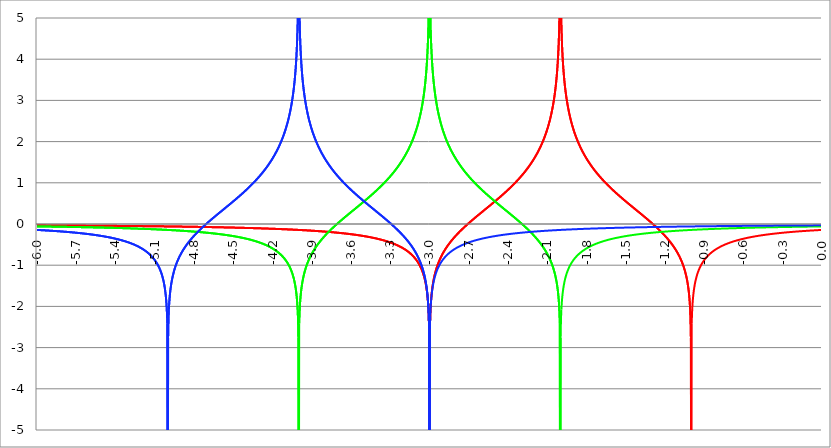
| Category | Series 1 | Series 0 | Series 2 |
|---|---|---|---|
| -6.0 | -0.032 | -0.059 | -0.144 |
| -5.997 | -0.032 | -0.059 | -0.144 |
| -5.994 | -0.032 | -0.059 | -0.145 |
| -5.991 | -0.032 | -0.059 | -0.145 |
| -5.988 | -0.032 | -0.059 | -0.146 |
| -5.984999999999999 | -0.033 | -0.06 | -0.146 |
| -5.982 | -0.033 | -0.06 | -0.147 |
| -5.979 | -0.033 | -0.06 | -0.147 |
| -5.976 | -0.033 | -0.06 | -0.148 |
| -5.972999999999999 | -0.033 | -0.06 | -0.148 |
| -5.969999999999999 | -0.033 | -0.06 | -0.149 |
| -5.966999999999999 | -0.033 | -0.06 | -0.15 |
| -5.963999999999999 | -0.033 | -0.06 | -0.15 |
| -5.960999999999998 | -0.033 | -0.061 | -0.151 |
| -5.957999999999998 | -0.033 | -0.061 | -0.151 |
| -5.954999999999998 | -0.033 | -0.061 | -0.152 |
| -5.951999999999998 | -0.033 | -0.061 | -0.152 |
| -5.948999999999998 | -0.033 | -0.061 | -0.153 |
| -5.945999999999998 | -0.033 | -0.061 | -0.153 |
| -5.942999999999998 | -0.033 | -0.061 | -0.154 |
| -5.939999999999997 | -0.033 | -0.061 | -0.154 |
| -5.936999999999997 | -0.033 | -0.062 | -0.155 |
| -5.933999999999997 | -0.033 | -0.062 | -0.156 |
| -5.930999999999997 | -0.033 | -0.062 | -0.156 |
| -5.927999999999997 | -0.034 | -0.062 | -0.157 |
| -5.924999999999997 | -0.034 | -0.062 | -0.157 |
| -5.921999999999997 | -0.034 | -0.062 | -0.158 |
| -5.918999999999997 | -0.034 | -0.062 | -0.158 |
| -5.915999999999997 | -0.034 | -0.063 | -0.159 |
| -5.912999999999997 | -0.034 | -0.063 | -0.16 |
| -5.909999999999996 | -0.034 | -0.063 | -0.16 |
| -5.906999999999996 | -0.034 | -0.063 | -0.161 |
| -5.903999999999996 | -0.034 | -0.063 | -0.161 |
| -5.900999999999996 | -0.034 | -0.063 | -0.162 |
| -5.897999999999996 | -0.034 | -0.063 | -0.163 |
| -5.894999999999996 | -0.034 | -0.064 | -0.163 |
| -5.891999999999996 | -0.034 | -0.064 | -0.164 |
| -5.888999999999996 | -0.034 | -0.064 | -0.164 |
| -5.885999999999996 | -0.034 | -0.064 | -0.165 |
| -5.882999999999996 | -0.034 | -0.064 | -0.166 |
| -5.879999999999995 | -0.034 | -0.064 | -0.166 |
| -5.876999999999995 | -0.034 | -0.064 | -0.167 |
| -5.873999999999995 | -0.034 | -0.065 | -0.168 |
| -5.870999999999995 | -0.035 | -0.065 | -0.168 |
| -5.867999999999995 | -0.035 | -0.065 | -0.169 |
| -5.864999999999995 | -0.035 | -0.065 | -0.169 |
| -5.861999999999995 | -0.035 | -0.065 | -0.17 |
| -5.858999999999995 | -0.035 | -0.065 | -0.171 |
| -5.855999999999994 | -0.035 | -0.065 | -0.171 |
| -5.852999999999994 | -0.035 | -0.066 | -0.172 |
| -5.849999999999994 | -0.035 | -0.066 | -0.173 |
| -5.846999999999994 | -0.035 | -0.066 | -0.173 |
| -5.843999999999994 | -0.035 | -0.066 | -0.174 |
| -5.840999999999994 | -0.035 | -0.066 | -0.175 |
| -5.837999999999994 | -0.035 | -0.066 | -0.175 |
| -5.834999999999994 | -0.035 | -0.066 | -0.176 |
| -5.831999999999994 | -0.035 | -0.067 | -0.177 |
| -5.828999999999993 | -0.035 | -0.067 | -0.178 |
| -5.825999999999993 | -0.035 | -0.067 | -0.178 |
| -5.822999999999993 | -0.035 | -0.067 | -0.179 |
| -5.819999999999993 | -0.035 | -0.067 | -0.18 |
| -5.816999999999993 | -0.036 | -0.067 | -0.18 |
| -5.813999999999993 | -0.036 | -0.068 | -0.181 |
| -5.810999999999993 | -0.036 | -0.068 | -0.182 |
| -5.807999999999993 | -0.036 | -0.068 | -0.183 |
| -5.804999999999993 | -0.036 | -0.068 | -0.183 |
| -5.801999999999992 | -0.036 | -0.068 | -0.184 |
| -5.798999999999992 | -0.036 | -0.068 | -0.185 |
| -5.795999999999992 | -0.036 | -0.068 | -0.186 |
| -5.792999999999992 | -0.036 | -0.069 | -0.186 |
| -5.789999999999992 | -0.036 | -0.069 | -0.187 |
| -5.786999999999992 | -0.036 | -0.069 | -0.188 |
| -5.783999999999992 | -0.036 | -0.069 | -0.189 |
| -5.780999999999992 | -0.036 | -0.069 | -0.189 |
| -5.777999999999992 | -0.036 | -0.069 | -0.19 |
| -5.774999999999991 | -0.036 | -0.07 | -0.191 |
| -5.771999999999991 | -0.036 | -0.07 | -0.192 |
| -5.768999999999991 | -0.036 | -0.07 | -0.193 |
| -5.765999999999991 | -0.037 | -0.07 | -0.193 |
| -5.762999999999991 | -0.037 | -0.07 | -0.194 |
| -5.759999999999991 | -0.037 | -0.07 | -0.195 |
| -5.756999999999991 | -0.037 | -0.071 | -0.196 |
| -5.753999999999991 | -0.037 | -0.071 | -0.197 |
| -5.75099999999999 | -0.037 | -0.071 | -0.197 |
| -5.74799999999999 | -0.037 | -0.071 | -0.198 |
| -5.74499999999999 | -0.037 | -0.071 | -0.199 |
| -5.74199999999999 | -0.037 | -0.071 | -0.2 |
| -5.73899999999999 | -0.037 | -0.072 | -0.201 |
| -5.73599999999999 | -0.037 | -0.072 | -0.202 |
| -5.73299999999999 | -0.037 | -0.072 | -0.202 |
| -5.72999999999999 | -0.037 | -0.072 | -0.203 |
| -5.72699999999999 | -0.037 | -0.072 | -0.204 |
| -5.723999999999989 | -0.037 | -0.072 | -0.205 |
| -5.720999999999989 | -0.037 | -0.073 | -0.206 |
| -5.717999999999989 | -0.038 | -0.073 | -0.207 |
| -5.714999999999989 | -0.038 | -0.073 | -0.208 |
| -5.71199999999999 | -0.038 | -0.073 | -0.209 |
| -5.708999999999989 | -0.038 | -0.073 | -0.21 |
| -5.705999999999989 | -0.038 | -0.073 | -0.21 |
| -5.702999999999989 | -0.038 | -0.074 | -0.211 |
| -5.699999999999989 | -0.038 | -0.074 | -0.212 |
| -5.696999999999988 | -0.038 | -0.074 | -0.213 |
| -5.693999999999988 | -0.038 | -0.074 | -0.214 |
| -5.690999999999988 | -0.038 | -0.074 | -0.215 |
| -5.687999999999988 | -0.038 | -0.074 | -0.216 |
| -5.684999999999988 | -0.038 | -0.075 | -0.217 |
| -5.681999999999988 | -0.038 | -0.075 | -0.218 |
| -5.678999999999988 | -0.038 | -0.075 | -0.219 |
| -5.675999999999988 | -0.038 | -0.075 | -0.22 |
| -5.672999999999988 | -0.039 | -0.075 | -0.221 |
| -5.669999999999987 | -0.039 | -0.076 | -0.222 |
| -5.666999999999987 | -0.039 | -0.076 | -0.223 |
| -5.663999999999987 | -0.039 | -0.076 | -0.224 |
| -5.660999999999987 | -0.039 | -0.076 | -0.225 |
| -5.657999999999987 | -0.039 | -0.076 | -0.226 |
| -5.654999999999987 | -0.039 | -0.076 | -0.227 |
| -5.651999999999987 | -0.039 | -0.077 | -0.228 |
| -5.648999999999987 | -0.039 | -0.077 | -0.229 |
| -5.645999999999986 | -0.039 | -0.077 | -0.23 |
| -5.642999999999986 | -0.039 | -0.077 | -0.231 |
| -5.639999999999986 | -0.039 | -0.077 | -0.232 |
| -5.636999999999986 | -0.039 | -0.078 | -0.234 |
| -5.633999999999986 | -0.039 | -0.078 | -0.235 |
| -5.630999999999986 | -0.039 | -0.078 | -0.236 |
| -5.627999999999986 | -0.04 | -0.078 | -0.237 |
| -5.624999999999986 | -0.04 | -0.078 | -0.238 |
| -5.621999999999986 | -0.04 | -0.079 | -0.239 |
| -5.618999999999985 | -0.04 | -0.079 | -0.24 |
| -5.615999999999985 | -0.04 | -0.079 | -0.241 |
| -5.612999999999985 | -0.04 | -0.079 | -0.243 |
| -5.609999999999985 | -0.04 | -0.079 | -0.244 |
| -5.606999999999985 | -0.04 | -0.08 | -0.245 |
| -5.603999999999985 | -0.04 | -0.08 | -0.246 |
| -5.600999999999985 | -0.04 | -0.08 | -0.247 |
| -5.597999999999985 | -0.04 | -0.08 | -0.248 |
| -5.594999999999985 | -0.04 | -0.08 | -0.25 |
| -5.591999999999984 | -0.04 | -0.081 | -0.251 |
| -5.588999999999984 | -0.04 | -0.081 | -0.252 |
| -5.585999999999984 | -0.04 | -0.081 | -0.253 |
| -5.582999999999984 | -0.041 | -0.081 | -0.255 |
| -5.579999999999984 | -0.041 | -0.081 | -0.256 |
| -5.576999999999984 | -0.041 | -0.082 | -0.257 |
| -5.573999999999984 | -0.041 | -0.082 | -0.258 |
| -5.570999999999984 | -0.041 | -0.082 | -0.26 |
| -5.567999999999984 | -0.041 | -0.082 | -0.261 |
| -5.564999999999984 | -0.041 | -0.082 | -0.262 |
| -5.561999999999983 | -0.041 | -0.083 | -0.264 |
| -5.558999999999983 | -0.041 | -0.083 | -0.265 |
| -5.555999999999983 | -0.041 | -0.083 | -0.266 |
| -5.552999999999983 | -0.041 | -0.083 | -0.268 |
| -5.549999999999983 | -0.041 | -0.083 | -0.269 |
| -5.546999999999983 | -0.041 | -0.084 | -0.271 |
| -5.543999999999983 | -0.041 | -0.084 | -0.272 |
| -5.540999999999983 | -0.042 | -0.084 | -0.273 |
| -5.537999999999982 | -0.042 | -0.084 | -0.275 |
| -5.534999999999982 | -0.042 | -0.085 | -0.276 |
| -5.531999999999982 | -0.042 | -0.085 | -0.278 |
| -5.528999999999982 | -0.042 | -0.085 | -0.279 |
| -5.525999999999982 | -0.042 | -0.085 | -0.281 |
| -5.522999999999982 | -0.042 | -0.085 | -0.282 |
| -5.519999999999982 | -0.042 | -0.086 | -0.284 |
| -5.516999999999982 | -0.042 | -0.086 | -0.285 |
| -5.513999999999982 | -0.042 | -0.086 | -0.287 |
| -5.510999999999981 | -0.042 | -0.086 | -0.288 |
| -5.507999999999981 | -0.042 | -0.087 | -0.29 |
| -5.504999999999981 | -0.042 | -0.087 | -0.291 |
| -5.501999999999981 | -0.043 | -0.087 | -0.293 |
| -5.498999999999981 | -0.043 | -0.087 | -0.294 |
| -5.495999999999981 | -0.043 | -0.087 | -0.296 |
| -5.492999999999981 | -0.043 | -0.088 | -0.298 |
| -5.48999999999998 | -0.043 | -0.088 | -0.299 |
| -5.48699999999998 | -0.043 | -0.088 | -0.301 |
| -5.48399999999998 | -0.043 | -0.088 | -0.303 |
| -5.48099999999998 | -0.043 | -0.089 | -0.304 |
| -5.47799999999998 | -0.043 | -0.089 | -0.306 |
| -5.47499999999998 | -0.043 | -0.089 | -0.308 |
| -5.47199999999998 | -0.043 | -0.089 | -0.309 |
| -5.46899999999998 | -0.043 | -0.09 | -0.311 |
| -5.46599999999998 | -0.043 | -0.09 | -0.313 |
| -5.46299999999998 | -0.044 | -0.09 | -0.315 |
| -5.45999999999998 | -0.044 | -0.09 | -0.317 |
| -5.45699999999998 | -0.044 | -0.091 | -0.318 |
| -5.45399999999998 | -0.044 | -0.091 | -0.32 |
| -5.45099999999998 | -0.044 | -0.091 | -0.322 |
| -5.44799999999998 | -0.044 | -0.091 | -0.324 |
| -5.444999999999979 | -0.044 | -0.092 | -0.326 |
| -5.441999999999978 | -0.044 | -0.092 | -0.328 |
| -5.438999999999978 | -0.044 | -0.092 | -0.33 |
| -5.435999999999978 | -0.044 | -0.092 | -0.332 |
| -5.432999999999978 | -0.044 | -0.093 | -0.334 |
| -5.429999999999978 | -0.044 | -0.093 | -0.336 |
| -5.426999999999978 | -0.044 | -0.093 | -0.338 |
| -5.423999999999978 | -0.045 | -0.093 | -0.34 |
| -5.420999999999978 | -0.045 | -0.094 | -0.342 |
| -5.417999999999978 | -0.045 | -0.094 | -0.344 |
| -5.414999999999978 | -0.045 | -0.094 | -0.346 |
| -5.411999999999977 | -0.045 | -0.094 | -0.348 |
| -5.408999999999977 | -0.045 | -0.095 | -0.35 |
| -5.405999999999977 | -0.045 | -0.095 | -0.352 |
| -5.402999999999977 | -0.045 | -0.095 | -0.355 |
| -5.399999999999977 | -0.045 | -0.095 | -0.357 |
| -5.396999999999977 | -0.045 | -0.096 | -0.359 |
| -5.393999999999977 | -0.045 | -0.096 | -0.361 |
| -5.390999999999977 | -0.045 | -0.096 | -0.364 |
| -5.387999999999977 | -0.046 | -0.096 | -0.366 |
| -5.384999999999977 | -0.046 | -0.097 | -0.368 |
| -5.381999999999976 | -0.046 | -0.097 | -0.371 |
| -5.378999999999976 | -0.046 | -0.097 | -0.373 |
| -5.375999999999976 | -0.046 | -0.097 | -0.376 |
| -5.372999999999976 | -0.046 | -0.098 | -0.378 |
| -5.369999999999976 | -0.046 | -0.098 | -0.38 |
| -5.366999999999976 | -0.046 | -0.098 | -0.383 |
| -5.363999999999976 | -0.046 | -0.099 | -0.386 |
| -5.360999999999976 | -0.046 | -0.099 | -0.388 |
| -5.357999999999976 | -0.046 | -0.099 | -0.391 |
| -5.354999999999976 | -0.047 | -0.099 | -0.393 |
| -5.351999999999975 | -0.047 | -0.1 | -0.396 |
| -5.348999999999975 | -0.047 | -0.1 | -0.399 |
| -5.345999999999975 | -0.047 | -0.1 | -0.401 |
| -5.342999999999975 | -0.047 | -0.101 | -0.404 |
| -5.339999999999974 | -0.047 | -0.101 | -0.407 |
| -5.336999999999974 | -0.047 | -0.101 | -0.41 |
| -5.333999999999974 | -0.047 | -0.101 | -0.413 |
| -5.330999999999974 | -0.047 | -0.102 | -0.416 |
| -5.327999999999974 | -0.047 | -0.102 | -0.419 |
| -5.324999999999974 | -0.047 | -0.102 | -0.422 |
| -5.321999999999974 | -0.047 | -0.103 | -0.425 |
| -5.318999999999974 | -0.048 | -0.103 | -0.428 |
| -5.315999999999974 | -0.048 | -0.103 | -0.431 |
| -5.312999999999974 | -0.048 | -0.103 | -0.434 |
| -5.309999999999974 | -0.048 | -0.104 | -0.437 |
| -5.306999999999974 | -0.048 | -0.104 | -0.44 |
| -5.303999999999974 | -0.048 | -0.104 | -0.443 |
| -5.300999999999973 | -0.048 | -0.105 | -0.447 |
| -5.297999999999973 | -0.048 | -0.105 | -0.45 |
| -5.294999999999973 | -0.048 | -0.105 | -0.454 |
| -5.291999999999973 | -0.048 | -0.106 | -0.457 |
| -5.288999999999973 | -0.048 | -0.106 | -0.46 |
| -5.285999999999973 | -0.049 | -0.106 | -0.464 |
| -5.282999999999973 | -0.049 | -0.107 | -0.468 |
| -5.279999999999972 | -0.049 | -0.107 | -0.471 |
| -5.276999999999972 | -0.049 | -0.107 | -0.475 |
| -5.273999999999972 | -0.049 | -0.107 | -0.479 |
| -5.270999999999972 | -0.049 | -0.108 | -0.483 |
| -5.267999999999972 | -0.049 | -0.108 | -0.486 |
| -5.264999999999972 | -0.049 | -0.108 | -0.49 |
| -5.261999999999972 | -0.049 | -0.109 | -0.494 |
| -5.258999999999972 | -0.049 | -0.109 | -0.498 |
| -5.255999999999972 | -0.05 | -0.109 | -0.502 |
| -5.252999999999972 | -0.05 | -0.11 | -0.507 |
| -5.249999999999971 | -0.05 | -0.11 | -0.511 |
| -5.246999999999971 | -0.05 | -0.11 | -0.515 |
| -5.243999999999971 | -0.05 | -0.111 | -0.519 |
| -5.240999999999971 | -0.05 | -0.111 | -0.524 |
| -5.237999999999971 | -0.05 | -0.111 | -0.528 |
| -5.234999999999971 | -0.05 | -0.112 | -0.533 |
| -5.23199999999997 | -0.05 | -0.112 | -0.538 |
| -5.228999999999971 | -0.05 | -0.112 | -0.542 |
| -5.225999999999971 | -0.051 | -0.113 | -0.547 |
| -5.222999999999971 | -0.051 | -0.113 | -0.552 |
| -5.21999999999997 | -0.051 | -0.113 | -0.557 |
| -5.21699999999997 | -0.051 | -0.114 | -0.562 |
| -5.21399999999997 | -0.051 | -0.114 | -0.567 |
| -5.21099999999997 | -0.051 | -0.114 | -0.573 |
| -5.20799999999997 | -0.051 | -0.115 | -0.578 |
| -5.20499999999997 | -0.051 | -0.115 | -0.583 |
| -5.20199999999997 | -0.051 | -0.115 | -0.589 |
| -5.19899999999997 | -0.051 | -0.116 | -0.595 |
| -5.19599999999997 | -0.052 | -0.116 | -0.6 |
| -5.192999999999969 | -0.052 | -0.117 | -0.606 |
| -5.18999999999997 | -0.052 | -0.117 | -0.612 |
| -5.18699999999997 | -0.052 | -0.117 | -0.618 |
| -5.18399999999997 | -0.052 | -0.118 | -0.625 |
| -5.180999999999969 | -0.052 | -0.118 | -0.631 |
| -5.177999999999969 | -0.052 | -0.118 | -0.638 |
| -5.174999999999969 | -0.052 | -0.119 | -0.644 |
| -5.171999999999968 | -0.052 | -0.119 | -0.651 |
| -5.168999999999968 | -0.052 | -0.119 | -0.658 |
| -5.165999999999968 | -0.053 | -0.12 | -0.665 |
| -5.162999999999968 | -0.053 | -0.12 | -0.672 |
| -5.159999999999968 | -0.053 | -0.121 | -0.68 |
| -5.156999999999968 | -0.053 | -0.121 | -0.687 |
| -5.153999999999968 | -0.053 | -0.121 | -0.695 |
| -5.150999999999968 | -0.053 | -0.122 | -0.703 |
| -5.147999999999968 | -0.053 | -0.122 | -0.711 |
| -5.144999999999968 | -0.053 | -0.123 | -0.719 |
| -5.141999999999967 | -0.053 | -0.123 | -0.728 |
| -5.138999999999967 | -0.054 | -0.123 | -0.737 |
| -5.135999999999967 | -0.054 | -0.124 | -0.746 |
| -5.132999999999967 | -0.054 | -0.124 | -0.755 |
| -5.129999999999967 | -0.054 | -0.124 | -0.764 |
| -5.126999999999967 | -0.054 | -0.125 | -0.774 |
| -5.123999999999967 | -0.054 | -0.125 | -0.784 |
| -5.120999999999967 | -0.054 | -0.126 | -0.794 |
| -5.117999999999967 | -0.054 | -0.126 | -0.805 |
| -5.114999999999966 | -0.054 | -0.127 | -0.816 |
| -5.111999999999966 | -0.054 | -0.127 | -0.827 |
| -5.108999999999966 | -0.055 | -0.127 | -0.839 |
| -5.105999999999966 | -0.055 | -0.128 | -0.851 |
| -5.102999999999966 | -0.055 | -0.128 | -0.863 |
| -5.099999999999965 | -0.055 | -0.129 | -0.876 |
| -5.096999999999965 | -0.055 | -0.129 | -0.889 |
| -5.093999999999965 | -0.055 | -0.129 | -0.903 |
| -5.090999999999965 | -0.055 | -0.13 | -0.917 |
| -5.087999999999965 | -0.055 | -0.13 | -0.931 |
| -5.084999999999965 | -0.056 | -0.131 | -0.947 |
| -5.081999999999965 | -0.056 | -0.131 | -0.963 |
| -5.078999999999965 | -0.056 | -0.132 | -0.979 |
| -5.075999999999964 | -0.056 | -0.132 | -0.997 |
| -5.072999999999964 | -0.056 | -0.132 | -1.015 |
| -5.069999999999964 | -0.056 | -0.133 | -1.034 |
| -5.066999999999964 | -0.056 | -0.133 | -1.053 |
| -5.063999999999964 | -0.056 | -0.134 | -1.074 |
| -5.060999999999964 | -0.056 | -0.134 | -1.096 |
| -5.057999999999964 | -0.057 | -0.135 | -1.119 |
| -5.054999999999964 | -0.057 | -0.135 | -1.144 |
| -5.051999999999964 | -0.057 | -0.136 | -1.17 |
| -5.048999999999964 | -0.057 | -0.136 | -1.197 |
| -5.045999999999964 | -0.057 | -0.136 | -1.227 |
| -5.042999999999964 | -0.057 | -0.137 | -1.258 |
| -5.039999999999963 | -0.057 | -0.137 | -1.292 |
| -5.036999999999963 | -0.057 | -0.138 | -1.329 |
| -5.033999999999963 | -0.058 | -0.138 | -1.369 |
| -5.030999999999963 | -0.058 | -0.139 | -1.413 |
| -5.027999999999963 | -0.058 | -0.139 | -1.462 |
| -5.024999999999963 | -0.058 | -0.14 | -1.516 |
| -5.021999999999963 | -0.058 | -0.14 | -1.578 |
| -5.018999999999963 | -0.058 | -0.141 | -1.649 |
| -5.015999999999963 | -0.058 | -0.141 | -1.733 |
| -5.012999999999963 | -0.058 | -0.142 | -1.835 |
| -5.009999999999962 | -0.058 | -0.142 | -1.963 |
| -5.006999999999962 | -0.059 | -0.143 | -2.14 |
| -5.003999999999962 | -0.059 | -0.143 | -2.417 |
| -5.000999999999962 | -0.059 | -0.144 | -10 |
| -4.997999999999962 | -0.059 | -0.144 | -2.759 |
| -4.994999999999962 | -0.059 | -0.145 | -2.299 |
| -4.991999999999961 | -0.059 | -0.145 | -2.062 |
| -4.988999999999961 | -0.059 | -0.146 | -1.9 |
| -4.985999999999961 | -0.059 | -0.146 | -1.777 |
| -4.982999999999961 | -0.06 | -0.147 | -1.678 |
| -4.97999999999996 | -0.06 | -0.147 | -1.594 |
| -4.97699999999996 | -0.06 | -0.148 | -1.522 |
| -4.97399999999996 | -0.06 | -0.148 | -1.458 |
| -4.97099999999996 | -0.06 | -0.149 | -1.402 |
| -4.967999999999961 | -0.06 | -0.149 | -1.35 |
| -4.964999999999961 | -0.06 | -0.15 | -1.303 |
| -4.96199999999996 | -0.061 | -0.15 | -1.259 |
| -4.95899999999996 | -0.061 | -0.151 | -1.219 |
| -4.95599999999996 | -0.061 | -0.151 | -1.181 |
| -4.95299999999996 | -0.061 | -0.152 | -1.146 |
| -4.94999999999996 | -0.061 | -0.153 | -1.113 |
| -4.94699999999996 | -0.061 | -0.153 | -1.081 |
| -4.94399999999996 | -0.061 | -0.154 | -1.051 |
| -4.94099999999996 | -0.061 | -0.154 | -1.023 |
| -4.93799999999996 | -0.062 | -0.155 | -0.995 |
| -4.93499999999996 | -0.062 | -0.155 | -0.969 |
| -4.93199999999996 | -0.062 | -0.156 | -0.944 |
| -4.928999999999959 | -0.062 | -0.156 | -0.92 |
| -4.925999999999959 | -0.062 | -0.157 | -0.897 |
| -4.922999999999959 | -0.062 | -0.158 | -0.875 |
| -4.91999999999996 | -0.062 | -0.158 | -0.853 |
| -4.916999999999959 | -0.063 | -0.159 | -0.832 |
| -4.913999999999959 | -0.063 | -0.159 | -0.812 |
| -4.910999999999959 | -0.063 | -0.16 | -0.793 |
| -4.907999999999959 | -0.063 | -0.161 | -0.773 |
| -4.904999999999958 | -0.063 | -0.161 | -0.755 |
| -4.901999999999958 | -0.063 | -0.162 | -0.737 |
| -4.898999999999958 | -0.063 | -0.162 | -0.719 |
| -4.895999999999958 | -0.063 | -0.163 | -0.702 |
| -4.892999999999958 | -0.064 | -0.164 | -0.685 |
| -4.889999999999958 | -0.064 | -0.164 | -0.669 |
| -4.886999999999958 | -0.064 | -0.165 | -0.653 |
| -4.883999999999958 | -0.064 | -0.165 | -0.637 |
| -4.880999999999958 | -0.064 | -0.166 | -0.622 |
| -4.877999999999957 | -0.064 | -0.167 | -0.607 |
| -4.874999999999957 | -0.064 | -0.167 | -0.592 |
| -4.871999999999957 | -0.065 | -0.168 | -0.577 |
| -4.868999999999957 | -0.065 | -0.169 | -0.563 |
| -4.865999999999957 | -0.065 | -0.169 | -0.549 |
| -4.862999999999957 | -0.065 | -0.17 | -0.535 |
| -4.859999999999957 | -0.065 | -0.171 | -0.522 |
| -4.856999999999957 | -0.065 | -0.171 | -0.509 |
| -4.853999999999957 | -0.065 | -0.172 | -0.496 |
| -4.850999999999956 | -0.066 | -0.173 | -0.483 |
| -4.847999999999956 | -0.066 | -0.173 | -0.47 |
| -4.844999999999956 | -0.066 | -0.174 | -0.458 |
| -4.841999999999956 | -0.066 | -0.175 | -0.445 |
| -4.838999999999956 | -0.066 | -0.175 | -0.433 |
| -4.835999999999956 | -0.066 | -0.176 | -0.421 |
| -4.832999999999956 | -0.067 | -0.177 | -0.409 |
| -4.829999999999956 | -0.067 | -0.177 | -0.397 |
| -4.826999999999955 | -0.067 | -0.178 | -0.386 |
| -4.823999999999955 | -0.067 | -0.179 | -0.375 |
| -4.820999999999955 | -0.067 | -0.179 | -0.363 |
| -4.817999999999955 | -0.067 | -0.18 | -0.352 |
| -4.814999999999955 | -0.067 | -0.181 | -0.341 |
| -4.811999999999955 | -0.068 | -0.182 | -0.33 |
| -4.808999999999955 | -0.068 | -0.182 | -0.319 |
| -4.805999999999955 | -0.068 | -0.183 | -0.309 |
| -4.802999999999955 | -0.068 | -0.184 | -0.298 |
| -4.799999999999954 | -0.068 | -0.185 | -0.288 |
| -4.796999999999954 | -0.068 | -0.185 | -0.277 |
| -4.793999999999954 | -0.069 | -0.186 | -0.267 |
| -4.790999999999954 | -0.069 | -0.187 | -0.257 |
| -4.787999999999954 | -0.069 | -0.188 | -0.247 |
| -4.784999999999954 | -0.069 | -0.188 | -0.237 |
| -4.781999999999954 | -0.069 | -0.189 | -0.227 |
| -4.778999999999954 | -0.069 | -0.19 | -0.217 |
| -4.775999999999954 | -0.069 | -0.191 | -0.207 |
| -4.772999999999953 | -0.07 | -0.191 | -0.198 |
| -4.769999999999953 | -0.07 | -0.192 | -0.188 |
| -4.766999999999953 | -0.07 | -0.193 | -0.178 |
| -4.763999999999953 | -0.07 | -0.194 | -0.169 |
| -4.760999999999953 | -0.07 | -0.195 | -0.16 |
| -4.757999999999953 | -0.07 | -0.195 | -0.15 |
| -4.754999999999953 | -0.071 | -0.196 | -0.141 |
| -4.751999999999953 | -0.071 | -0.197 | -0.132 |
| -4.748999999999953 | -0.071 | -0.198 | -0.123 |
| -4.745999999999952 | -0.071 | -0.199 | -0.114 |
| -4.742999999999952 | -0.071 | -0.2 | -0.104 |
| -4.739999999999952 | -0.071 | -0.2 | -0.095 |
| -4.736999999999952 | -0.072 | -0.201 | -0.087 |
| -4.733999999999952 | -0.072 | -0.202 | -0.078 |
| -4.730999999999952 | -0.072 | -0.203 | -0.069 |
| -4.727999999999952 | -0.072 | -0.204 | -0.06 |
| -4.724999999999952 | -0.072 | -0.205 | -0.051 |
| -4.721999999999951 | -0.072 | -0.206 | -0.043 |
| -4.718999999999951 | -0.073 | -0.207 | -0.034 |
| -4.715999999999951 | -0.073 | -0.207 | -0.025 |
| -4.712999999999951 | -0.073 | -0.208 | -0.017 |
| -4.709999999999951 | -0.073 | -0.209 | -0.008 |
| -4.706999999999951 | -0.073 | -0.21 | 0 |
| -4.703999999999951 | -0.074 | -0.211 | 0.009 |
| -4.700999999999951 | -0.074 | -0.212 | 0.017 |
| -4.697999999999951 | -0.074 | -0.213 | 0.026 |
| -4.69499999999995 | -0.074 | -0.214 | 0.034 |
| -4.69199999999995 | -0.074 | -0.215 | 0.042 |
| -4.68899999999995 | -0.074 | -0.216 | 0.051 |
| -4.68599999999995 | -0.075 | -0.217 | 0.059 |
| -4.68299999999995 | -0.075 | -0.218 | 0.067 |
| -4.67999999999995 | -0.075 | -0.219 | 0.075 |
| -4.67699999999995 | -0.075 | -0.22 | 0.084 |
| -4.67399999999995 | -0.075 | -0.221 | 0.092 |
| -4.67099999999995 | -0.076 | -0.222 | 0.1 |
| -4.667999999999949 | -0.076 | -0.223 | 0.108 |
| -4.664999999999949 | -0.076 | -0.224 | 0.116 |
| -4.661999999999949 | -0.076 | -0.225 | 0.124 |
| -4.658999999999949 | -0.076 | -0.226 | 0.132 |
| -4.655999999999949 | -0.076 | -0.227 | 0.14 |
| -4.652999999999949 | -0.077 | -0.228 | 0.148 |
| -4.649999999999949 | -0.077 | -0.229 | 0.156 |
| -4.646999999999949 | -0.077 | -0.23 | 0.164 |
| -4.643999999999949 | -0.077 | -0.231 | 0.172 |
| -4.640999999999948 | -0.077 | -0.232 | 0.18 |
| -4.637999999999948 | -0.078 | -0.233 | 0.188 |
| -4.634999999999948 | -0.078 | -0.234 | 0.196 |
| -4.631999999999948 | -0.078 | -0.235 | 0.204 |
| -4.628999999999948 | -0.078 | -0.236 | 0.212 |
| -4.625999999999948 | -0.078 | -0.238 | 0.22 |
| -4.622999999999948 | -0.079 | -0.239 | 0.228 |
| -4.619999999999948 | -0.079 | -0.24 | 0.235 |
| -4.616999999999947 | -0.079 | -0.241 | 0.243 |
| -4.613999999999947 | -0.079 | -0.242 | 0.251 |
| -4.610999999999947 | -0.079 | -0.243 | 0.259 |
| -4.607999999999947 | -0.08 | -0.244 | 0.267 |
| -4.604999999999947 | -0.08 | -0.246 | 0.275 |
| -4.601999999999947 | -0.08 | -0.247 | 0.282 |
| -4.598999999999947 | -0.08 | -0.248 | 0.29 |
| -4.595999999999947 | -0.08 | -0.249 | 0.298 |
| -4.592999999999947 | -0.081 | -0.25 | 0.306 |
| -4.589999999999946 | -0.081 | -0.252 | 0.314 |
| -4.586999999999946 | -0.081 | -0.253 | 0.321 |
| -4.583999999999946 | -0.081 | -0.254 | 0.329 |
| -4.580999999999946 | -0.081 | -0.255 | 0.337 |
| -4.577999999999946 | -0.082 | -0.257 | 0.345 |
| -4.574999999999946 | -0.082 | -0.258 | 0.353 |
| -4.571999999999945 | -0.082 | -0.259 | 0.36 |
| -4.568999999999946 | -0.082 | -0.261 | 0.368 |
| -4.565999999999946 | -0.082 | -0.262 | 0.376 |
| -4.562999999999946 | -0.083 | -0.263 | 0.384 |
| -4.559999999999945 | -0.083 | -0.265 | 0.392 |
| -4.556999999999945 | -0.083 | -0.266 | 0.399 |
| -4.553999999999945 | -0.083 | -0.267 | 0.407 |
| -4.550999999999945 | -0.083 | -0.269 | 0.415 |
| -4.547999999999945 | -0.084 | -0.27 | 0.423 |
| -4.544999999999945 | -0.084 | -0.271 | 0.431 |
| -4.541999999999944 | -0.084 | -0.273 | 0.439 |
| -4.538999999999944 | -0.084 | -0.274 | 0.446 |
| -4.535999999999944 | -0.084 | -0.276 | 0.454 |
| -4.532999999999944 | -0.085 | -0.277 | 0.462 |
| -4.529999999999944 | -0.085 | -0.279 | 0.47 |
| -4.526999999999944 | -0.085 | -0.28 | 0.478 |
| -4.523999999999944 | -0.085 | -0.282 | 0.486 |
| -4.520999999999944 | -0.086 | -0.283 | 0.494 |
| -4.517999999999944 | -0.086 | -0.285 | 0.502 |
| -4.514999999999944 | -0.086 | -0.286 | 0.509 |
| -4.511999999999944 | -0.086 | -0.288 | 0.517 |
| -4.508999999999943 | -0.086 | -0.289 | 0.525 |
| -4.505999999999943 | -0.087 | -0.291 | 0.533 |
| -4.502999999999943 | -0.087 | -0.292 | 0.541 |
| -4.499999999999943 | -0.087 | -0.294 | 0.549 |
| -4.496999999999943 | -0.087 | -0.296 | 0.557 |
| -4.493999999999943 | -0.088 | -0.297 | 0.565 |
| -4.490999999999943 | -0.088 | -0.299 | 0.573 |
| -4.487999999999943 | -0.088 | -0.3 | 0.581 |
| -4.484999999999943 | -0.088 | -0.302 | 0.59 |
| -4.481999999999942 | -0.089 | -0.304 | 0.598 |
| -4.478999999999942 | -0.089 | -0.305 | 0.606 |
| -4.475999999999942 | -0.089 | -0.307 | 0.614 |
| -4.472999999999942 | -0.089 | -0.309 | 0.622 |
| -4.469999999999942 | -0.09 | -0.311 | 0.63 |
| -4.466999999999942 | -0.09 | -0.312 | 0.638 |
| -4.463999999999942 | -0.09 | -0.314 | 0.647 |
| -4.460999999999942 | -0.09 | -0.316 | 0.655 |
| -4.457999999999942 | -0.09 | -0.318 | 0.663 |
| -4.454999999999941 | -0.091 | -0.32 | 0.671 |
| -4.451999999999941 | -0.091 | -0.322 | 0.68 |
| -4.448999999999941 | -0.091 | -0.323 | 0.688 |
| -4.445999999999941 | -0.091 | -0.325 | 0.697 |
| -4.442999999999941 | -0.092 | -0.327 | 0.705 |
| -4.43999999999994 | -0.092 | -0.329 | 0.713 |
| -4.43699999999994 | -0.092 | -0.331 | 0.722 |
| -4.43399999999994 | -0.092 | -0.333 | 0.73 |
| -4.43099999999994 | -0.093 | -0.335 | 0.739 |
| -4.42799999999994 | -0.093 | -0.337 | 0.747 |
| -4.42499999999994 | -0.093 | -0.339 | 0.756 |
| -4.42199999999994 | -0.093 | -0.341 | 0.765 |
| -4.41899999999994 | -0.094 | -0.343 | 0.773 |
| -4.41599999999994 | -0.094 | -0.345 | 0.782 |
| -4.41299999999994 | -0.094 | -0.347 | 0.791 |
| -4.40999999999994 | -0.094 | -0.35 | 0.8 |
| -4.40699999999994 | -0.095 | -0.352 | 0.808 |
| -4.40399999999994 | -0.095 | -0.354 | 0.817 |
| -4.40099999999994 | -0.095 | -0.356 | 0.826 |
| -4.397999999999939 | -0.096 | -0.358 | 0.835 |
| -4.394999999999939 | -0.096 | -0.361 | 0.844 |
| -4.391999999999939 | -0.096 | -0.363 | 0.853 |
| -4.388999999999939 | -0.096 | -0.365 | 0.862 |
| -4.385999999999939 | -0.097 | -0.368 | 0.871 |
| -4.382999999999939 | -0.097 | -0.37 | 0.88 |
| -4.379999999999938 | -0.097 | -0.372 | 0.89 |
| -4.376999999999938 | -0.097 | -0.375 | 0.899 |
| -4.373999999999938 | -0.098 | -0.377 | 0.908 |
| -4.370999999999938 | -0.098 | -0.38 | 0.918 |
| -4.367999999999938 | -0.098 | -0.382 | 0.927 |
| -4.364999999999938 | -0.098 | -0.385 | 0.936 |
| -4.361999999999938 | -0.099 | -0.387 | 0.946 |
| -4.358999999999938 | -0.099 | -0.39 | 0.955 |
| -4.355999999999938 | -0.099 | -0.392 | 0.965 |
| -4.352999999999938 | -0.1 | -0.395 | 0.975 |
| -4.349999999999937 | -0.1 | -0.398 | 0.984 |
| -4.346999999999937 | -0.1 | -0.401 | 0.994 |
| -4.343999999999937 | -0.1 | -0.403 | 1.004 |
| -4.340999999999937 | -0.101 | -0.406 | 1.014 |
| -4.337999999999937 | -0.101 | -0.409 | 1.024 |
| -4.334999999999937 | -0.101 | -0.412 | 1.034 |
| -4.331999999999936 | -0.102 | -0.415 | 1.044 |
| -4.328999999999937 | -0.102 | -0.418 | 1.054 |
| -4.325999999999937 | -0.102 | -0.421 | 1.065 |
| -4.322999999999936 | -0.102 | -0.424 | 1.075 |
| -4.319999999999936 | -0.103 | -0.427 | 1.085 |
| -4.316999999999936 | -0.103 | -0.43 | 1.096 |
| -4.313999999999936 | -0.103 | -0.433 | 1.106 |
| -4.310999999999936 | -0.104 | -0.436 | 1.117 |
| -4.307999999999936 | -0.104 | -0.439 | 1.128 |
| -4.304999999999936 | -0.104 | -0.442 | 1.139 |
| -4.301999999999935 | -0.105 | -0.446 | 1.15 |
| -4.298999999999935 | -0.105 | -0.449 | 1.16 |
| -4.295999999999935 | -0.105 | -0.452 | 1.172 |
| -4.292999999999935 | -0.105 | -0.456 | 1.183 |
| -4.289999999999935 | -0.106 | -0.459 | 1.194 |
| -4.286999999999935 | -0.106 | -0.463 | 1.205 |
| -4.283999999999934 | -0.106 | -0.466 | 1.217 |
| -4.280999999999934 | -0.107 | -0.47 | 1.228 |
| -4.277999999999934 | -0.107 | -0.474 | 1.24 |
| -4.274999999999934 | -0.107 | -0.477 | 1.252 |
| -4.271999999999934 | -0.108 | -0.481 | 1.264 |
| -4.268999999999934 | -0.108 | -0.485 | 1.275 |
| -4.265999999999934 | -0.108 | -0.489 | 1.288 |
| -4.262999999999934 | -0.109 | -0.493 | 1.3 |
| -4.259999999999934 | -0.109 | -0.497 | 1.312 |
| -4.256999999999934 | -0.109 | -0.501 | 1.325 |
| -4.253999999999934 | -0.11 | -0.505 | 1.337 |
| -4.250999999999934 | -0.11 | -0.509 | 1.35 |
| -4.247999999999934 | -0.11 | -0.514 | 1.363 |
| -4.244999999999933 | -0.111 | -0.518 | 1.376 |
| -4.241999999999933 | -0.111 | -0.522 | 1.389 |
| -4.238999999999933 | -0.111 | -0.527 | 1.402 |
| -4.235999999999933 | -0.112 | -0.531 | 1.415 |
| -4.232999999999933 | -0.112 | -0.536 | 1.429 |
| -4.229999999999933 | -0.112 | -0.541 | 1.443 |
| -4.226999999999933 | -0.113 | -0.546 | 1.456 |
| -4.223999999999933 | -0.113 | -0.551 | 1.47 |
| -4.220999999999933 | -0.113 | -0.555 | 1.485 |
| -4.217999999999932 | -0.114 | -0.561 | 1.499 |
| -4.214999999999932 | -0.114 | -0.566 | 1.513 |
| -4.211999999999932 | -0.114 | -0.571 | 1.528 |
| -4.208999999999932 | -0.115 | -0.576 | 1.543 |
| -4.205999999999932 | -0.115 | -0.582 | 1.558 |
| -4.202999999999932 | -0.115 | -0.587 | 1.574 |
| -4.199999999999932 | -0.116 | -0.593 | 1.589 |
| -4.196999999999932 | -0.116 | -0.599 | 1.605 |
| -4.193999999999932 | -0.116 | -0.604 | 1.621 |
| -4.190999999999931 | -0.117 | -0.61 | 1.637 |
| -4.187999999999931 | -0.117 | -0.616 | 1.653 |
| -4.184999999999931 | -0.118 | -0.623 | 1.67 |
| -4.181999999999931 | -0.118 | -0.629 | 1.687 |
| -4.178999999999931 | -0.118 | -0.635 | 1.704 |
| -4.175999999999931 | -0.119 | -0.642 | 1.722 |
| -4.172999999999931 | -0.119 | -0.649 | 1.739 |
| -4.169999999999931 | -0.119 | -0.656 | 1.757 |
| -4.166999999999931 | -0.12 | -0.663 | 1.776 |
| -4.16399999999993 | -0.12 | -0.67 | 1.794 |
| -4.16099999999993 | -0.12 | -0.677 | 1.813 |
| -4.15799999999993 | -0.121 | -0.685 | 1.833 |
| -4.15499999999993 | -0.121 | -0.692 | 1.852 |
| -4.15199999999993 | -0.122 | -0.7 | 1.872 |
| -4.14899999999993 | -0.122 | -0.708 | 1.893 |
| -4.14599999999993 | -0.122 | -0.717 | 1.913 |
| -4.14299999999993 | -0.123 | -0.725 | 1.935 |
| -4.13999999999993 | -0.123 | -0.734 | 1.956 |
| -4.13699999999993 | -0.124 | -0.743 | 1.978 |
| -4.13399999999993 | -0.124 | -0.752 | 2.001 |
| -4.13099999999993 | -0.124 | -0.761 | 2.024 |
| -4.127999999999929 | -0.125 | -0.771 | 2.047 |
| -4.124999999999929 | -0.125 | -0.781 | 2.072 |
| -4.121999999999929 | -0.126 | -0.791 | 2.096 |
| -4.118999999999929 | -0.126 | -0.801 | 2.122 |
| -4.115999999999929 | -0.126 | -0.812 | 2.147 |
| -4.112999999999928 | -0.127 | -0.823 | 2.174 |
| -4.109999999999928 | -0.127 | -0.835 | 2.201 |
| -4.106999999999928 | -0.128 | -0.846 | 2.229 |
| -4.103999999999928 | -0.128 | -0.859 | 2.258 |
| -4.100999999999928 | -0.128 | -0.871 | 2.288 |
| -4.097999999999928 | -0.129 | -0.884 | 2.318 |
| -4.094999999999928 | -0.129 | -0.898 | 2.349 |
| -4.091999999999927 | -0.13 | -0.912 | 2.382 |
| -4.088999999999927 | -0.13 | -0.926 | 2.415 |
| -4.085999999999927 | -0.131 | -0.942 | 2.45 |
| -4.082999999999927 | -0.131 | -0.957 | 2.485 |
| -4.079999999999927 | -0.131 | -0.974 | 2.523 |
| -4.076999999999927 | -0.132 | -0.991 | 2.561 |
| -4.073999999999927 | -0.132 | -1.008 | 2.601 |
| -4.070999999999926 | -0.133 | -1.027 | 2.643 |
| -4.067999999999927 | -0.133 | -1.047 | 2.686 |
| -4.064999999999927 | -0.134 | -1.067 | 2.731 |
| -4.061999999999926 | -0.134 | -1.089 | 2.779 |
| -4.058999999999926 | -0.135 | -1.111 | 2.828 |
| -4.055999999999926 | -0.135 | -1.135 | 2.881 |
| -4.052999999999926 | -0.135 | -1.161 | 2.936 |
| -4.049999999999926 | -0.136 | -1.188 | 2.994 |
| -4.046999999999925 | -0.136 | -1.217 | 3.057 |
| -4.043999999999925 | -0.137 | -1.247 | 3.123 |
| -4.040999999999925 | -0.137 | -1.281 | 3.193 |
| -4.037999999999925 | -0.138 | -1.316 | 3.269 |
| -4.034999999999925 | -0.138 | -1.355 | 3.352 |
| -4.031999999999925 | -0.139 | -1.398 | 3.442 |
| -4.028999999999925 | -0.139 | -1.445 | 3.54 |
| -4.025999999999925 | -0.14 | -1.497 | 3.649 |
| -4.022999999999925 | -0.14 | -1.557 | 3.772 |
| -4.019999999999924 | -0.141 | -1.624 | 3.912 |
| -4.016999999999924 | -0.141 | -1.703 | 4.074 |
| -4.013999999999924 | -0.142 | -1.798 | 4.269 |
| -4.010999999999924 | -0.142 | -1.917 | 4.51 |
| -4.007999999999924 | -0.143 | -2.074 | 4.828 |
| -4.004999999999924 | -0.143 | -2.306 | 5.298 |
| -4.001999999999924 | -0.144 | -2.762 | 6.215 |
| -3.998999999999924 | -0.144 | -10 | 6.908 |
| -3.995999999999924 | -0.145 | -2.411 | 5.521 |
| -3.992999999999924 | -0.145 | -2.129 | 4.962 |
| -3.989999999999924 | -0.146 | -1.948 | 4.605 |
| -3.986999999999924 | -0.146 | -1.815 | 4.343 |
| -3.983999999999924 | -0.147 | -1.709 | 4.135 |
| -3.980999999999923 | -0.147 | -1.621 | 3.963 |
| -3.977999999999923 | -0.148 | -1.545 | 3.816 |
| -3.974999999999923 | -0.148 | -1.479 | 3.689 |
| -3.971999999999923 | -0.149 | -1.42 | 3.575 |
| -3.968999999999923 | -0.149 | -1.367 | 3.473 |
| -3.965999999999923 | -0.15 | -1.318 | 3.381 |
| -3.962999999999923 | -0.15 | -1.273 | 3.296 |
| -3.959999999999923 | -0.151 | -1.232 | 3.218 |
| -3.956999999999923 | -0.151 | -1.194 | 3.146 |
| -3.953999999999922 | -0.152 | -1.158 | 3.078 |
| -3.950999999999922 | -0.152 | -1.124 | 3.015 |
| -3.947999999999922 | -0.153 | -1.091 | 2.955 |
| -3.944999999999922 | -0.153 | -1.061 | 2.899 |
| -3.941999999999922 | -0.154 | -1.032 | 2.846 |
| -3.938999999999922 | -0.155 | -1.004 | 2.795 |
| -3.935999999999922 | -0.155 | -0.978 | 2.747 |
| -3.932999999999922 | -0.156 | -0.953 | 2.701 |
| -3.929999999999922 | -0.156 | -0.928 | 2.657 |
| -3.926999999999921 | -0.157 | -0.905 | 2.615 |
| -3.923999999999921 | -0.157 | -0.882 | 2.574 |
| -3.920999999999921 | -0.158 | -0.86 | 2.535 |
| -3.917999999999921 | -0.159 | -0.839 | 2.498 |
| -3.914999999999921 | -0.159 | -0.819 | 2.461 |
| -3.911999999999921 | -0.16 | -0.799 | 2.427 |
| -3.908999999999921 | -0.16 | -0.78 | 2.393 |
| -3.905999999999921 | -0.161 | -0.761 | 2.36 |
| -3.902999999999921 | -0.162 | -0.743 | 2.328 |
| -3.89999999999992 | -0.162 | -0.725 | 2.298 |
| -3.89699999999992 | -0.163 | -0.708 | 2.268 |
| -3.89399999999992 | -0.163 | -0.691 | 2.239 |
| -3.89099999999992 | -0.164 | -0.674 | 2.21 |
| -3.88799999999992 | -0.165 | -0.658 | 2.183 |
| -3.88499999999992 | -0.165 | -0.642 | 2.156 |
| -3.88199999999992 | -0.166 | -0.627 | 2.13 |
| -3.87899999999992 | -0.167 | -0.612 | 2.105 |
| -3.875999999999919 | -0.167 | -0.597 | 2.08 |
| -3.872999999999919 | -0.168 | -0.582 | 2.055 |
| -3.869999999999919 | -0.168 | -0.568 | 2.032 |
| -3.866999999999919 | -0.169 | -0.554 | 2.008 |
| -3.863999999999919 | -0.17 | -0.54 | 1.986 |
| -3.860999999999919 | -0.17 | -0.526 | 1.964 |
| -3.857999999999919 | -0.171 | -0.513 | 1.942 |
| -3.854999999999919 | -0.172 | -0.5 | 1.92 |
| -3.851999999999919 | -0.172 | -0.487 | 1.899 |
| -3.848999999999918 | -0.173 | -0.474 | 1.879 |
| -3.845999999999918 | -0.174 | -0.462 | 1.859 |
| -3.842999999999918 | -0.174 | -0.449 | 1.839 |
| -3.839999999999918 | -0.175 | -0.437 | 1.82 |
| -3.836999999999918 | -0.176 | -0.425 | 1.801 |
| -3.833999999999918 | -0.176 | -0.413 | 1.782 |
| -3.830999999999918 | -0.177 | -0.401 | 1.763 |
| -3.827999999999918 | -0.178 | -0.39 | 1.745 |
| -3.824999999999918 | -0.179 | -0.378 | 1.727 |
| -3.821999999999917 | -0.179 | -0.367 | 1.71 |
| -3.818999999999917 | -0.18 | -0.356 | 1.693 |
| -3.815999999999917 | -0.181 | -0.345 | 1.676 |
| -3.812999999999917 | -0.181 | -0.334 | 1.659 |
| -3.809999999999917 | -0.182 | -0.323 | 1.642 |
| -3.806999999999917 | -0.183 | -0.312 | 1.626 |
| -3.803999999999917 | -0.184 | -0.302 | 1.61 |
| -3.800999999999917 | -0.184 | -0.291 | 1.594 |
| -3.797999999999916 | -0.185 | -0.281 | 1.579 |
| -3.794999999999916 | -0.186 | -0.27 | 1.563 |
| -3.791999999999916 | -0.187 | -0.26 | 1.548 |
| -3.788999999999916 | -0.187 | -0.25 | 1.533 |
| -3.785999999999916 | -0.188 | -0.24 | 1.518 |
| -3.782999999999916 | -0.189 | -0.23 | 1.504 |
| -3.779999999999916 | -0.19 | -0.22 | 1.489 |
| -3.776999999999916 | -0.19 | -0.211 | 1.475 |
| -3.773999999999916 | -0.191 | -0.201 | 1.461 |
| -3.770999999999915 | -0.192 | -0.191 | 1.447 |
| -3.767999999999915 | -0.193 | -0.182 | 1.433 |
| -3.764999999999915 | -0.194 | -0.172 | 1.42 |
| -3.761999999999915 | -0.194 | -0.163 | 1.406 |
| -3.758999999999915 | -0.195 | -0.153 | 1.393 |
| -3.755999999999915 | -0.196 | -0.144 | 1.38 |
| -3.752999999999915 | -0.197 | -0.135 | 1.367 |
| -3.749999999999915 | -0.198 | -0.126 | 1.354 |
| -3.746999999999915 | -0.198 | -0.117 | 1.341 |
| -3.743999999999914 | -0.199 | -0.107 | 1.329 |
| -3.740999999999914 | -0.2 | -0.098 | 1.316 |
| -3.737999999999914 | -0.201 | -0.09 | 1.304 |
| -3.734999999999914 | -0.202 | -0.081 | 1.292 |
| -3.731999999999914 | -0.203 | -0.072 | 1.28 |
| -3.728999999999914 | -0.204 | -0.063 | 1.267 |
| -3.725999999999914 | -0.204 | -0.054 | 1.256 |
| -3.722999999999914 | -0.205 | -0.045 | 1.244 |
| -3.719999999999914 | -0.206 | -0.037 | 1.232 |
| -3.716999999999913 | -0.207 | -0.028 | 1.221 |
| -3.713999999999913 | -0.208 | -0.02 | 1.209 |
| -3.710999999999913 | -0.209 | -0.011 | 1.198 |
| -3.707999999999913 | -0.21 | -0.003 | 1.186 |
| -3.704999999999913 | -0.211 | 0.006 | 1.175 |
| -3.701999999999913 | -0.212 | 0.014 | 1.164 |
| -3.698999999999913 | -0.213 | 0.023 | 1.153 |
| -3.695999999999913 | -0.214 | 0.031 | 1.142 |
| -3.692999999999912 | -0.215 | 0.04 | 1.131 |
| -3.689999999999912 | -0.215 | 0.048 | 1.121 |
| -3.686999999999912 | -0.216 | 0.056 | 1.11 |
| -3.683999999999912 | -0.217 | 0.064 | 1.099 |
| -3.680999999999912 | -0.218 | 0.073 | 1.089 |
| -3.677999999999912 | -0.219 | 0.081 | 1.078 |
| -3.674999999999912 | -0.22 | 0.089 | 1.068 |
| -3.671999999999912 | -0.221 | 0.097 | 1.058 |
| -3.668999999999912 | -0.222 | 0.105 | 1.048 |
| -3.665999999999911 | -0.223 | 0.113 | 1.037 |
| -3.662999999999911 | -0.224 | 0.121 | 1.027 |
| -3.659999999999911 | -0.225 | 0.13 | 1.017 |
| -3.656999999999911 | -0.226 | 0.138 | 1.007 |
| -3.653999999999911 | -0.227 | 0.146 | 0.998 |
| -3.650999999999911 | -0.229 | 0.154 | 0.988 |
| -3.647999999999911 | -0.23 | 0.162 | 0.978 |
| -3.644999999999911 | -0.231 | 0.17 | 0.968 |
| -3.641999999999911 | -0.232 | 0.178 | 0.959 |
| -3.63899999999991 | -0.233 | 0.185 | 0.949 |
| -3.63599999999991 | -0.234 | 0.193 | 0.94 |
| -3.63299999999991 | -0.235 | 0.201 | 0.93 |
| -3.62999999999991 | -0.236 | 0.209 | 0.921 |
| -3.62699999999991 | -0.237 | 0.217 | 0.911 |
| -3.62399999999991 | -0.238 | 0.225 | 0.902 |
| -3.62099999999991 | -0.239 | 0.233 | 0.893 |
| -3.61799999999991 | -0.241 | 0.241 | 0.883 |
| -3.61499999999991 | -0.242 | 0.249 | 0.874 |
| -3.611999999999909 | -0.243 | 0.256 | 0.865 |
| -3.608999999999909 | -0.244 | 0.264 | 0.856 |
| -3.605999999999909 | -0.245 | 0.272 | 0.847 |
| -3.602999999999909 | -0.246 | 0.28 | 0.838 |
| -3.599999999999909 | -0.248 | 0.288 | 0.829 |
| -3.596999999999909 | -0.249 | 0.295 | 0.82 |
| -3.593999999999909 | -0.25 | 0.303 | 0.811 |
| -3.590999999999909 | -0.251 | 0.311 | 0.803 |
| -3.587999999999909 | -0.253 | 0.319 | 0.794 |
| -3.584999999999908 | -0.254 | 0.327 | 0.785 |
| -3.581999999999908 | -0.255 | 0.334 | 0.776 |
| -3.578999999999908 | -0.256 | 0.342 | 0.768 |
| -3.575999999999908 | -0.258 | 0.35 | 0.759 |
| -3.572999999999908 | -0.259 | 0.358 | 0.75 |
| -3.569999999999908 | -0.26 | 0.366 | 0.742 |
| -3.566999999999908 | -0.261 | 0.373 | 0.733 |
| -3.563999999999908 | -0.263 | 0.381 | 0.725 |
| -3.560999999999908 | -0.264 | 0.389 | 0.716 |
| -3.557999999999907 | -0.265 | 0.397 | 0.708 |
| -3.554999999999907 | -0.267 | 0.405 | 0.699 |
| -3.551999999999907 | -0.268 | 0.412 | 0.691 |
| -3.548999999999907 | -0.27 | 0.42 | 0.683 |
| -3.545999999999907 | -0.271 | 0.428 | 0.674 |
| -3.542999999999907 | -0.272 | 0.436 | 0.666 |
| -3.539999999999907 | -0.274 | 0.444 | 0.658 |
| -3.536999999999907 | -0.275 | 0.452 | 0.649 |
| -3.533999999999907 | -0.277 | 0.46 | 0.641 |
| -3.530999999999906 | -0.278 | 0.467 | 0.633 |
| -3.527999999999906 | -0.28 | 0.475 | 0.625 |
| -3.524999999999906 | -0.281 | 0.483 | 0.617 |
| -3.521999999999906 | -0.283 | 0.491 | 0.608 |
| -3.518999999999906 | -0.284 | 0.499 | 0.6 |
| -3.515999999999906 | -0.286 | 0.507 | 0.592 |
| -3.512999999999906 | -0.287 | 0.515 | 0.584 |
| -3.509999999999906 | -0.289 | 0.523 | 0.576 |
| -3.506999999999906 | -0.29 | 0.531 | 0.568 |
| -3.503999999999905 | -0.292 | 0.539 | 0.56 |
| -3.500999999999905 | -0.293 | 0.547 | 0.552 |
| -3.497999999999905 | -0.295 | 0.555 | 0.544 |
| -3.494999999999905 | -0.297 | 0.563 | 0.536 |
| -3.491999999999905 | -0.298 | 0.571 | 0.528 |
| -3.488999999999905 | -0.3 | 0.579 | 0.52 |
| -3.485999999999905 | -0.302 | 0.587 | 0.512 |
| -3.482999999999905 | -0.303 | 0.595 | 0.504 |
| -3.479999999999904 | -0.305 | 0.603 | 0.496 |
| -3.476999999999904 | -0.307 | 0.611 | 0.488 |
| -3.473999999999904 | -0.308 | 0.619 | 0.481 |
| -3.470999999999904 | -0.31 | 0.627 | 0.473 |
| -3.467999999999904 | -0.312 | 0.636 | 0.465 |
| -3.464999999999904 | -0.314 | 0.644 | 0.457 |
| -3.461999999999904 | -0.315 | 0.652 | 0.449 |
| -3.458999999999904 | -0.317 | 0.66 | 0.441 |
| -3.455999999999904 | -0.319 | 0.669 | 0.433 |
| -3.452999999999903 | -0.321 | 0.677 | 0.426 |
| -3.449999999999903 | -0.323 | 0.685 | 0.418 |
| -3.446999999999903 | -0.325 | 0.694 | 0.41 |
| -3.443999999999903 | -0.327 | 0.702 | 0.402 |
| -3.440999999999903 | -0.328 | 0.711 | 0.394 |
| -3.437999999999903 | -0.33 | 0.719 | 0.386 |
| -3.434999999999903 | -0.332 | 0.728 | 0.379 |
| -3.431999999999903 | -0.334 | 0.736 | 0.371 |
| -3.428999999999903 | -0.336 | 0.745 | 0.363 |
| -3.425999999999902 | -0.338 | 0.753 | 0.355 |
| -3.422999999999902 | -0.34 | 0.762 | 0.347 |
| -3.419999999999902 | -0.343 | 0.77 | 0.34 |
| -3.416999999999902 | -0.345 | 0.779 | 0.332 |
| -3.413999999999902 | -0.347 | 0.788 | 0.324 |
| -3.410999999999902 | -0.349 | 0.797 | 0.316 |
| -3.407999999999902 | -0.351 | 0.805 | 0.309 |
| -3.404999999999902 | -0.353 | 0.814 | 0.301 |
| -3.401999999999902 | -0.355 | 0.823 | 0.293 |
| -3.398999999999901 | -0.358 | 0.832 | 0.285 |
| -3.395999999999901 | -0.36 | 0.841 | 0.277 |
| -3.392999999999901 | -0.362 | 0.85 | 0.269 |
| -3.389999999999901 | -0.364 | 0.859 | 0.262 |
| -3.386999999999901 | -0.367 | 0.868 | 0.254 |
| -3.383999999999901 | -0.369 | 0.877 | 0.246 |
| -3.380999999999901 | -0.372 | 0.887 | 0.238 |
| -3.377999999999901 | -0.374 | 0.896 | 0.23 |
| -3.3749999999999 | -0.376 | 0.905 | 0.222 |
| -3.3719999999999 | -0.379 | 0.914 | 0.214 |
| -3.3689999999999 | -0.381 | 0.924 | 0.207 |
| -3.3659999999999 | -0.384 | 0.933 | 0.199 |
| -3.3629999999999 | -0.386 | 0.943 | 0.191 |
| -3.3599999999999 | -0.389 | 0.952 | 0.183 |
| -3.3569999999999 | -0.392 | 0.962 | 0.175 |
| -3.3539999999999 | -0.394 | 0.972 | 0.167 |
| -3.3509999999999 | -0.397 | 0.981 | 0.159 |
| -3.347999999999899 | -0.4 | 0.991 | 0.151 |
| -3.344999999999899 | -0.402 | 1.001 | 0.143 |
| -3.341999999999899 | -0.405 | 1.011 | 0.135 |
| -3.338999999999899 | -0.408 | 1.021 | 0.127 |
| -3.335999999999899 | -0.411 | 1.031 | 0.119 |
| -3.332999999999899 | -0.414 | 1.041 | 0.111 |
| -3.329999999999899 | -0.417 | 1.051 | 0.103 |
| -3.326999999999899 | -0.42 | 1.061 | 0.094 |
| -3.323999999999899 | -0.423 | 1.072 | 0.086 |
| -3.320999999999898 | -0.426 | 1.082 | 0.078 |
| -3.317999999999898 | -0.429 | 1.092 | 0.07 |
| -3.314999999999898 | -0.432 | 1.103 | 0.062 |
| -3.311999999999898 | -0.435 | 1.114 | 0.053 |
| -3.308999999999898 | -0.438 | 1.124 | 0.045 |
| -3.305999999999898 | -0.441 | 1.135 | 0.037 |
| -3.302999999999898 | -0.445 | 1.146 | 0.028 |
| -3.299999999999898 | -0.448 | 1.157 | 0.02 |
| -3.296999999999898 | -0.451 | 1.168 | 0.012 |
| -3.293999999999897 | -0.455 | 1.179 | 0.003 |
| -3.290999999999897 | -0.458 | 1.19 | -0.005 |
| -3.287999999999897 | -0.462 | 1.202 | -0.014 |
| -3.284999999999897 | -0.465 | 1.213 | -0.022 |
| -3.281999999999897 | -0.469 | 1.224 | -0.031 |
| -3.278999999999897 | -0.472 | 1.236 | -0.04 |
| -3.275999999999897 | -0.476 | 1.248 | -0.048 |
| -3.272999999999897 | -0.48 | 1.26 | -0.057 |
| -3.269999999999897 | -0.484 | 1.271 | -0.066 |
| -3.266999999999896 | -0.488 | 1.284 | -0.075 |
| -3.263999999999896 | -0.492 | 1.296 | -0.084 |
| -3.260999999999896 | -0.496 | 1.308 | -0.093 |
| -3.257999999999896 | -0.5 | 1.32 | -0.101 |
| -3.254999999999896 | -0.504 | 1.333 | -0.11 |
| -3.251999999999896 | -0.508 | 1.346 | -0.12 |
| -3.248999999999896 | -0.512 | 1.358 | -0.129 |
| -3.245999999999896 | -0.517 | 1.371 | -0.138 |
| -3.242999999999896 | -0.521 | 1.384 | -0.147 |
| -3.239999999999895 | -0.525 | 1.397 | -0.156 |
| -3.236999999999895 | -0.53 | 1.411 | -0.166 |
| -3.233999999999895 | -0.535 | 1.424 | -0.175 |
| -3.230999999999895 | -0.539 | 1.438 | -0.185 |
| -3.227999999999895 | -0.544 | 1.452 | -0.194 |
| -3.224999999999895 | -0.549 | 1.466 | -0.204 |
| -3.221999999999895 | -0.554 | 1.48 | -0.214 |
| -3.218999999999895 | -0.559 | 1.494 | -0.224 |
| -3.215999999999894 | -0.564 | 1.509 | -0.233 |
| -3.212999999999894 | -0.569 | 1.523 | -0.243 |
| -3.209999999999894 | -0.574 | 1.538 | -0.253 |
| -3.206999999999894 | -0.58 | 1.553 | -0.264 |
| -3.203999999999894 | -0.585 | 1.568 | -0.274 |
| -3.200999999999894 | -0.591 | 1.584 | -0.284 |
| -3.197999999999894 | -0.597 | 1.599 | -0.295 |
| -3.194999999999894 | -0.602 | 1.615 | -0.305 |
| -3.191999999999894 | -0.608 | 1.631 | -0.316 |
| -3.188999999999893 | -0.614 | 1.648 | -0.327 |
| -3.185999999999893 | -0.621 | 1.664 | -0.337 |
| -3.182999999999893 | -0.627 | 1.681 | -0.348 |
| -3.179999999999893 | -0.633 | 1.698 | -0.36 |
| -3.176999999999893 | -0.64 | 1.716 | -0.371 |
| -3.173999999999893 | -0.646 | 1.733 | -0.382 |
| -3.170999999999893 | -0.653 | 1.751 | -0.394 |
| -3.167999999999893 | -0.66 | 1.769 | -0.405 |
| -3.164999999999893 | -0.667 | 1.788 | -0.417 |
| -3.161999999999892 | -0.675 | 1.807 | -0.429 |
| -3.158999999999892 | -0.682 | 1.826 | -0.441 |
| -3.155999999999892 | -0.69 | 1.846 | -0.453 |
| -3.152999999999892 | -0.698 | 1.865 | -0.466 |
| -3.149999999999892 | -0.706 | 1.886 | -0.478 |
| -3.146999999999892 | -0.714 | 1.906 | -0.491 |
| -3.143999999999892 | -0.722 | 1.927 | -0.504 |
| -3.140999999999892 | -0.731 | 1.949 | -0.517 |
| -3.137999999999892 | -0.74 | 1.971 | -0.531 |
| -3.134999999999891 | -0.749 | 1.993 | -0.545 |
| -3.131999999999891 | -0.758 | 2.016 | -0.558 |
| -3.128999999999891 | -0.767 | 2.04 | -0.573 |
| -3.125999999999891 | -0.777 | 2.063 | -0.587 |
| -3.122999999999891 | -0.787 | 2.088 | -0.602 |
| -3.119999999999891 | -0.798 | 2.113 | -0.617 |
| -3.116999999999891 | -0.808 | 2.139 | -0.632 |
| -3.113999999999891 | -0.819 | 2.165 | -0.648 |
| -3.110999999999891 | -0.831 | 2.192 | -0.663 |
| -3.10799999999989 | -0.842 | 2.22 | -0.68 |
| -3.10499999999989 | -0.855 | 2.248 | -0.696 |
| -3.10199999999989 | -0.867 | 2.278 | -0.713 |
| -3.09899999999989 | -0.88 | 2.308 | -0.731 |
| -3.09599999999989 | -0.893 | 2.339 | -0.749 |
| -3.09299999999989 | -0.907 | 2.371 | -0.767 |
| -3.08999999999989 | -0.922 | 2.404 | -0.786 |
| -3.08699999999989 | -0.936 | 2.438 | -0.806 |
| -3.083999999999889 | -0.952 | 2.473 | -0.826 |
| -3.080999999999889 | -0.968 | 2.51 | -0.846 |
| -3.077999999999889 | -0.985 | 2.548 | -0.868 |
| -3.074999999999889 | -1.002 | 2.587 | -0.89 |
| -3.071999999999889 | -1.021 | 2.628 | -0.913 |
| -3.068999999999889 | -1.04 | 2.671 | -0.936 |
| -3.065999999999889 | -1.06 | 2.716 | -0.961 |
| -3.062999999999889 | -1.081 | 2.763 | -0.987 |
| -3.059999999999889 | -1.104 | 2.812 | -1.013 |
| -3.056999999999888 | -1.127 | 2.863 | -1.042 |
| -3.053999999999888 | -1.152 | 2.917 | -1.071 |
| -3.050999999999888 | -1.179 | 2.975 | -1.102 |
| -3.047999999999888 | -1.207 | 3.035 | -1.135 |
| -3.044999999999888 | -1.237 | 3.1 | -1.169 |
| -3.041999999999888 | -1.269 | 3.169 | -1.206 |
| -3.038999999999888 | -1.304 | 3.243 | -1.246 |
| -3.035999999999888 | -1.342 | 3.324 | -1.288 |
| -3.032999999999888 | -1.383 | 3.411 | -1.334 |
| -3.029999999999887 | -1.429 | 3.506 | -1.384 |
| -3.026999999999887 | -1.479 | 3.612 | -1.439 |
| -3.023999999999887 | -1.536 | 3.729 | -1.5 |
| -3.020999999999887 | -1.601 | 3.863 | -1.569 |
| -3.017999999999887 | -1.675 | 4.017 | -1.648 |
| -3.014999999999887 | -1.764 | 4.2 | -1.742 |
| -3.011999999999887 | -1.874 | 4.423 | -1.856 |
| -3.008999999999887 | -2.015 | 4.71 | -2.002 |
| -3.005999999999887 | -2.216 | 5.116 | -2.207 |
| -3.002999999999886 | -2.56 | 5.809 | -2.556 |
| -2.999999999999886 | -14.556 | 29.805 | -14.556 |
| -2.996999999999886 | -2.556 | 5.809 | -2.56 |
| -2.993999999999886 | -2.207 | 5.116 | -2.216 |
| -2.990999999999886 | -2.002 | 4.71 | -2.015 |
| -2.987999999999886 | -1.856 | 4.423 | -1.874 |
| -2.984999999999886 | -1.742 | 4.2 | -1.764 |
| -2.981999999999886 | -1.648 | 4.017 | -1.675 |
| -2.978999999999885 | -1.569 | 3.863 | -1.601 |
| -2.975999999999885 | -1.5 | 3.729 | -1.536 |
| -2.972999999999885 | -1.439 | 3.612 | -1.479 |
| -2.969999999999885 | -1.384 | 3.506 | -1.429 |
| -2.966999999999885 | -1.334 | 3.411 | -1.383 |
| -2.963999999999885 | -1.288 | 3.324 | -1.342 |
| -2.960999999999885 | -1.246 | 3.243 | -1.304 |
| -2.957999999999885 | -1.206 | 3.169 | -1.269 |
| -2.954999999999885 | -1.169 | 3.1 | -1.237 |
| -2.951999999999884 | -1.135 | 3.035 | -1.207 |
| -2.948999999999884 | -1.102 | 2.975 | -1.179 |
| -2.945999999999884 | -1.071 | 2.917 | -1.152 |
| -2.942999999999884 | -1.042 | 2.863 | -1.127 |
| -2.939999999999884 | -1.013 | 2.812 | -1.104 |
| -2.936999999999884 | -0.987 | 2.763 | -1.081 |
| -2.933999999999884 | -0.961 | 2.716 | -1.06 |
| -2.930999999999884 | -0.936 | 2.671 | -1.04 |
| -2.927999999999884 | -0.913 | 2.628 | -1.021 |
| -2.924999999999883 | -0.89 | 2.587 | -1.002 |
| -2.921999999999883 | -0.868 | 2.548 | -0.985 |
| -2.918999999999883 | -0.846 | 2.51 | -0.968 |
| -2.915999999999883 | -0.826 | 2.473 | -0.952 |
| -2.912999999999883 | -0.806 | 2.438 | -0.936 |
| -2.909999999999883 | -0.786 | 2.404 | -0.922 |
| -2.906999999999883 | -0.767 | 2.371 | -0.907 |
| -2.903999999999883 | -0.749 | 2.339 | -0.893 |
| -2.900999999999883 | -0.731 | 2.308 | -0.88 |
| -2.897999999999882 | -0.713 | 2.278 | -0.867 |
| -2.894999999999882 | -0.696 | 2.248 | -0.855 |
| -2.891999999999882 | -0.68 | 2.22 | -0.842 |
| -2.888999999999882 | -0.663 | 2.192 | -0.831 |
| -2.885999999999882 | -0.648 | 2.165 | -0.819 |
| -2.882999999999882 | -0.632 | 2.139 | -0.808 |
| -2.879999999999882 | -0.617 | 2.113 | -0.798 |
| -2.876999999999882 | -0.602 | 2.088 | -0.787 |
| -2.873999999999881 | -0.587 | 2.063 | -0.777 |
| -2.870999999999881 | -0.573 | 2.04 | -0.767 |
| -2.867999999999881 | -0.558 | 2.016 | -0.758 |
| -2.864999999999881 | -0.545 | 1.993 | -0.749 |
| -2.861999999999881 | -0.531 | 1.971 | -0.74 |
| -2.858999999999881 | -0.517 | 1.949 | -0.731 |
| -2.855999999999881 | -0.504 | 1.927 | -0.722 |
| -2.852999999999881 | -0.491 | 1.906 | -0.714 |
| -2.849999999999881 | -0.478 | 1.886 | -0.706 |
| -2.84699999999988 | -0.466 | 1.865 | -0.698 |
| -2.84399999999988 | -0.453 | 1.846 | -0.69 |
| -2.84099999999988 | -0.441 | 1.826 | -0.682 |
| -2.83799999999988 | -0.429 | 1.807 | -0.675 |
| -2.83499999999988 | -0.417 | 1.788 | -0.667 |
| -2.83199999999988 | -0.405 | 1.769 | -0.66 |
| -2.82899999999988 | -0.394 | 1.751 | -0.653 |
| -2.82599999999988 | -0.382 | 1.733 | -0.646 |
| -2.82299999999988 | -0.371 | 1.716 | -0.64 |
| -2.819999999999879 | -0.36 | 1.698 | -0.633 |
| -2.816999999999879 | -0.348 | 1.681 | -0.627 |
| -2.813999999999879 | -0.337 | 1.664 | -0.621 |
| -2.810999999999879 | -0.327 | 1.648 | -0.614 |
| -2.807999999999879 | -0.316 | 1.631 | -0.608 |
| -2.804999999999879 | -0.305 | 1.615 | -0.602 |
| -2.801999999999879 | -0.295 | 1.599 | -0.597 |
| -2.798999999999879 | -0.284 | 1.584 | -0.591 |
| -2.795999999999878 | -0.274 | 1.568 | -0.585 |
| -2.792999999999878 | -0.264 | 1.553 | -0.58 |
| -2.789999999999878 | -0.253 | 1.538 | -0.574 |
| -2.786999999999878 | -0.243 | 1.523 | -0.569 |
| -2.783999999999878 | -0.233 | 1.509 | -0.564 |
| -2.780999999999878 | -0.224 | 1.494 | -0.559 |
| -2.777999999999878 | -0.214 | 1.48 | -0.554 |
| -2.774999999999878 | -0.204 | 1.466 | -0.549 |
| -2.771999999999878 | -0.194 | 1.452 | -0.544 |
| -2.768999999999877 | -0.185 | 1.438 | -0.539 |
| -2.765999999999877 | -0.175 | 1.424 | -0.535 |
| -2.762999999999877 | -0.166 | 1.411 | -0.53 |
| -2.759999999999877 | -0.156 | 1.397 | -0.525 |
| -2.756999999999877 | -0.147 | 1.384 | -0.521 |
| -2.753999999999877 | -0.138 | 1.371 | -0.517 |
| -2.750999999999877 | -0.129 | 1.358 | -0.512 |
| -2.747999999999877 | -0.12 | 1.346 | -0.508 |
| -2.744999999999877 | -0.11 | 1.333 | -0.504 |
| -2.741999999999876 | -0.101 | 1.32 | -0.5 |
| -2.738999999999876 | -0.093 | 1.308 | -0.496 |
| -2.735999999999876 | -0.084 | 1.296 | -0.492 |
| -2.732999999999876 | -0.075 | 1.284 | -0.488 |
| -2.729999999999876 | -0.066 | 1.271 | -0.484 |
| -2.726999999999876 | -0.057 | 1.26 | -0.48 |
| -2.723999999999876 | -0.048 | 1.248 | -0.476 |
| -2.720999999999876 | -0.04 | 1.236 | -0.472 |
| -2.717999999999876 | -0.031 | 1.224 | -0.469 |
| -2.714999999999875 | -0.022 | 1.213 | -0.465 |
| -2.711999999999875 | -0.014 | 1.202 | -0.462 |
| -2.708999999999875 | -0.005 | 1.19 | -0.458 |
| -2.705999999999875 | 0.003 | 1.179 | -0.455 |
| -2.702999999999875 | 0.012 | 1.168 | -0.451 |
| -2.699999999999875 | 0.02 | 1.157 | -0.448 |
| -2.696999999999875 | 0.028 | 1.146 | -0.445 |
| -2.693999999999875 | 0.037 | 1.135 | -0.441 |
| -2.690999999999874 | 0.045 | 1.124 | -0.438 |
| -2.687999999999874 | 0.053 | 1.114 | -0.435 |
| -2.684999999999874 | 0.062 | 1.103 | -0.432 |
| -2.681999999999874 | 0.07 | 1.092 | -0.429 |
| -2.678999999999874 | 0.078 | 1.082 | -0.426 |
| -2.675999999999874 | 0.086 | 1.072 | -0.423 |
| -2.672999999999874 | 0.094 | 1.061 | -0.42 |
| -2.669999999999874 | 0.103 | 1.051 | -0.417 |
| -2.666999999999874 | 0.111 | 1.041 | -0.414 |
| -2.663999999999873 | 0.119 | 1.031 | -0.411 |
| -2.660999999999873 | 0.127 | 1.021 | -0.408 |
| -2.657999999999873 | 0.135 | 1.011 | -0.405 |
| -2.654999999999873 | 0.143 | 1.001 | -0.402 |
| -2.651999999999873 | 0.151 | 0.991 | -0.4 |
| -2.648999999999873 | 0.159 | 0.981 | -0.397 |
| -2.645999999999873 | 0.167 | 0.972 | -0.394 |
| -2.642999999999873 | 0.175 | 0.962 | -0.392 |
| -2.639999999999873 | 0.183 | 0.952 | -0.389 |
| -2.636999999999872 | 0.191 | 0.943 | -0.386 |
| -2.633999999999872 | 0.199 | 0.933 | -0.384 |
| -2.630999999999872 | 0.207 | 0.924 | -0.381 |
| -2.627999999999872 | 0.214 | 0.914 | -0.379 |
| -2.624999999999872 | 0.222 | 0.905 | -0.376 |
| -2.621999999999872 | 0.23 | 0.896 | -0.374 |
| -2.618999999999872 | 0.238 | 0.887 | -0.372 |
| -2.615999999999872 | 0.246 | 0.877 | -0.369 |
| -2.612999999999872 | 0.254 | 0.868 | -0.367 |
| -2.609999999999871 | 0.262 | 0.859 | -0.364 |
| -2.606999999999871 | 0.269 | 0.85 | -0.362 |
| -2.603999999999871 | 0.277 | 0.841 | -0.36 |
| -2.600999999999871 | 0.285 | 0.832 | -0.358 |
| -2.597999999999871 | 0.293 | 0.823 | -0.355 |
| -2.594999999999871 | 0.301 | 0.814 | -0.353 |
| -2.591999999999871 | 0.309 | 0.805 | -0.351 |
| -2.588999999999871 | 0.316 | 0.797 | -0.349 |
| -2.585999999999871 | 0.324 | 0.788 | -0.347 |
| -2.58299999999987 | 0.332 | 0.779 | -0.345 |
| -2.57999999999987 | 0.34 | 0.77 | -0.343 |
| -2.57699999999987 | 0.347 | 0.762 | -0.34 |
| -2.57399999999987 | 0.355 | 0.753 | -0.338 |
| -2.57099999999987 | 0.363 | 0.745 | -0.336 |
| -2.56799999999987 | 0.371 | 0.736 | -0.334 |
| -2.56499999999987 | 0.379 | 0.728 | -0.332 |
| -2.56199999999987 | 0.386 | 0.719 | -0.33 |
| -2.55899999999987 | 0.394 | 0.711 | -0.328 |
| -2.555999999999869 | 0.402 | 0.702 | -0.327 |
| -2.552999999999869 | 0.41 | 0.694 | -0.325 |
| -2.549999999999869 | 0.418 | 0.685 | -0.323 |
| -2.546999999999869 | 0.426 | 0.677 | -0.321 |
| -2.543999999999869 | 0.433 | 0.669 | -0.319 |
| -2.540999999999869 | 0.441 | 0.66 | -0.317 |
| -2.537999999999869 | 0.449 | 0.652 | -0.315 |
| -2.534999999999869 | 0.457 | 0.644 | -0.314 |
| -2.531999999999869 | 0.465 | 0.636 | -0.312 |
| -2.528999999999868 | 0.473 | 0.627 | -0.31 |
| -2.525999999999868 | 0.481 | 0.619 | -0.308 |
| -2.522999999999868 | 0.488 | 0.611 | -0.307 |
| -2.519999999999868 | 0.496 | 0.603 | -0.305 |
| -2.516999999999868 | 0.504 | 0.595 | -0.303 |
| -2.513999999999868 | 0.512 | 0.587 | -0.302 |
| -2.510999999999868 | 0.52 | 0.579 | -0.3 |
| -2.507999999999868 | 0.528 | 0.571 | -0.298 |
| -2.504999999999868 | 0.536 | 0.563 | -0.297 |
| -2.501999999999867 | 0.544 | 0.555 | -0.295 |
| -2.498999999999867 | 0.552 | 0.547 | -0.293 |
| -2.495999999999867 | 0.56 | 0.539 | -0.292 |
| -2.492999999999867 | 0.568 | 0.531 | -0.29 |
| -2.489999999999867 | 0.576 | 0.523 | -0.289 |
| -2.486999999999867 | 0.584 | 0.515 | -0.287 |
| -2.483999999999867 | 0.592 | 0.507 | -0.286 |
| -2.480999999999867 | 0.6 | 0.499 | -0.284 |
| -2.477999999999867 | 0.608 | 0.491 | -0.283 |
| -2.474999999999866 | 0.617 | 0.483 | -0.281 |
| -2.471999999999866 | 0.625 | 0.475 | -0.28 |
| -2.468999999999866 | 0.633 | 0.467 | -0.278 |
| -2.465999999999866 | 0.641 | 0.46 | -0.277 |
| -2.462999999999866 | 0.649 | 0.452 | -0.275 |
| -2.459999999999866 | 0.658 | 0.444 | -0.274 |
| -2.456999999999866 | 0.666 | 0.436 | -0.272 |
| -2.453999999999866 | 0.674 | 0.428 | -0.271 |
| -2.450999999999865 | 0.683 | 0.42 | -0.27 |
| -2.447999999999865 | 0.691 | 0.412 | -0.268 |
| -2.444999999999865 | 0.699 | 0.405 | -0.267 |
| -2.441999999999865 | 0.708 | 0.397 | -0.265 |
| -2.438999999999865 | 0.716 | 0.389 | -0.264 |
| -2.435999999999865 | 0.725 | 0.381 | -0.263 |
| -2.432999999999865 | 0.733 | 0.373 | -0.261 |
| -2.429999999999865 | 0.742 | 0.366 | -0.26 |
| -2.426999999999865 | 0.75 | 0.358 | -0.259 |
| -2.423999999999864 | 0.759 | 0.35 | -0.258 |
| -2.420999999999864 | 0.768 | 0.342 | -0.256 |
| -2.417999999999864 | 0.776 | 0.334 | -0.255 |
| -2.414999999999864 | 0.785 | 0.327 | -0.254 |
| -2.411999999999864 | 0.794 | 0.319 | -0.253 |
| -2.408999999999864 | 0.803 | 0.311 | -0.251 |
| -2.405999999999864 | 0.811 | 0.303 | -0.25 |
| -2.402999999999864 | 0.82 | 0.295 | -0.249 |
| -2.399999999999864 | 0.829 | 0.288 | -0.248 |
| -2.396999999999863 | 0.838 | 0.28 | -0.246 |
| -2.393999999999863 | 0.847 | 0.272 | -0.245 |
| -2.390999999999863 | 0.856 | 0.264 | -0.244 |
| -2.387999999999863 | 0.865 | 0.256 | -0.243 |
| -2.384999999999863 | 0.874 | 0.249 | -0.242 |
| -2.381999999999863 | 0.883 | 0.241 | -0.241 |
| -2.378999999999863 | 0.893 | 0.233 | -0.239 |
| -2.375999999999863 | 0.902 | 0.225 | -0.238 |
| -2.372999999999863 | 0.911 | 0.217 | -0.237 |
| -2.369999999999862 | 0.921 | 0.209 | -0.236 |
| -2.366999999999862 | 0.93 | 0.201 | -0.235 |
| -2.363999999999862 | 0.94 | 0.193 | -0.234 |
| -2.360999999999862 | 0.949 | 0.185 | -0.233 |
| -2.357999999999862 | 0.959 | 0.178 | -0.232 |
| -2.354999999999862 | 0.968 | 0.17 | -0.231 |
| -2.351999999999862 | 0.978 | 0.162 | -0.23 |
| -2.348999999999862 | 0.988 | 0.154 | -0.229 |
| -2.345999999999861 | 0.998 | 0.146 | -0.227 |
| -2.342999999999861 | 1.007 | 0.138 | -0.226 |
| -2.339999999999861 | 1.017 | 0.13 | -0.225 |
| -2.336999999999861 | 1.027 | 0.121 | -0.224 |
| -2.333999999999861 | 1.037 | 0.113 | -0.223 |
| -2.330999999999861 | 1.048 | 0.105 | -0.222 |
| -2.327999999999861 | 1.058 | 0.097 | -0.221 |
| -2.324999999999861 | 1.068 | 0.089 | -0.22 |
| -2.321999999999861 | 1.078 | 0.081 | -0.219 |
| -2.31899999999986 | 1.089 | 0.073 | -0.218 |
| -2.31599999999986 | 1.099 | 0.064 | -0.217 |
| -2.31299999999986 | 1.11 | 0.056 | -0.216 |
| -2.30999999999986 | 1.121 | 0.048 | -0.215 |
| -2.30699999999986 | 1.131 | 0.04 | -0.215 |
| -2.30399999999986 | 1.142 | 0.031 | -0.214 |
| -2.30099999999986 | 1.153 | 0.023 | -0.213 |
| -2.29799999999986 | 1.164 | 0.014 | -0.212 |
| -2.29499999999986 | 1.175 | 0.006 | -0.211 |
| -2.291999999999859 | 1.186 | -0.003 | -0.21 |
| -2.288999999999859 | 1.198 | -0.011 | -0.209 |
| -2.285999999999859 | 1.209 | -0.02 | -0.208 |
| -2.282999999999859 | 1.221 | -0.028 | -0.207 |
| -2.279999999999859 | 1.232 | -0.037 | -0.206 |
| -2.276999999999859 | 1.244 | -0.045 | -0.205 |
| -2.273999999999859 | 1.256 | -0.054 | -0.204 |
| -2.270999999999859 | 1.267 | -0.063 | -0.204 |
| -2.267999999999859 | 1.28 | -0.072 | -0.203 |
| -2.264999999999858 | 1.292 | -0.081 | -0.202 |
| -2.261999999999858 | 1.304 | -0.09 | -0.201 |
| -2.258999999999858 | 1.316 | -0.098 | -0.2 |
| -2.255999999999858 | 1.329 | -0.107 | -0.199 |
| -2.252999999999858 | 1.341 | -0.117 | -0.198 |
| -2.249999999999858 | 1.354 | -0.126 | -0.198 |
| -2.246999999999858 | 1.367 | -0.135 | -0.197 |
| -2.243999999999858 | 1.38 | -0.144 | -0.196 |
| -2.240999999999858 | 1.393 | -0.153 | -0.195 |
| -2.237999999999857 | 1.406 | -0.163 | -0.194 |
| -2.234999999999857 | 1.42 | -0.172 | -0.194 |
| -2.231999999999857 | 1.433 | -0.182 | -0.193 |
| -2.228999999999857 | 1.447 | -0.191 | -0.192 |
| -2.225999999999857 | 1.461 | -0.201 | -0.191 |
| -2.222999999999857 | 1.475 | -0.211 | -0.19 |
| -2.219999999999857 | 1.489 | -0.22 | -0.19 |
| -2.216999999999857 | 1.504 | -0.23 | -0.189 |
| -2.213999999999857 | 1.518 | -0.24 | -0.188 |
| -2.210999999999856 | 1.533 | -0.25 | -0.187 |
| -2.207999999999856 | 1.548 | -0.26 | -0.187 |
| -2.204999999999856 | 1.563 | -0.27 | -0.186 |
| -2.201999999999856 | 1.579 | -0.281 | -0.185 |
| -2.198999999999856 | 1.594 | -0.291 | -0.184 |
| -2.195999999999856 | 1.61 | -0.302 | -0.184 |
| -2.192999999999856 | 1.626 | -0.312 | -0.183 |
| -2.189999999999856 | 1.642 | -0.323 | -0.182 |
| -2.186999999999855 | 1.659 | -0.334 | -0.181 |
| -2.183999999999855 | 1.676 | -0.345 | -0.181 |
| -2.180999999999855 | 1.693 | -0.356 | -0.18 |
| -2.177999999999855 | 1.71 | -0.367 | -0.179 |
| -2.174999999999855 | 1.727 | -0.378 | -0.179 |
| -2.171999999999855 | 1.745 | -0.39 | -0.178 |
| -2.168999999999855 | 1.763 | -0.401 | -0.177 |
| -2.165999999999855 | 1.782 | -0.413 | -0.176 |
| -2.162999999999855 | 1.801 | -0.425 | -0.176 |
| -2.159999999999854 | 1.82 | -0.437 | -0.175 |
| -2.156999999999854 | 1.839 | -0.449 | -0.174 |
| -2.153999999999854 | 1.859 | -0.462 | -0.174 |
| -2.150999999999854 | 1.879 | -0.474 | -0.173 |
| -2.147999999999854 | 1.899 | -0.487 | -0.172 |
| -2.144999999999854 | 1.92 | -0.5 | -0.172 |
| -2.141999999999854 | 1.942 | -0.513 | -0.171 |
| -2.138999999999854 | 1.964 | -0.526 | -0.17 |
| -2.135999999999854 | 1.986 | -0.54 | -0.17 |
| -2.132999999999853 | 2.008 | -0.554 | -0.169 |
| -2.129999999999853 | 2.032 | -0.568 | -0.168 |
| -2.126999999999853 | 2.055 | -0.582 | -0.168 |
| -2.123999999999853 | 2.08 | -0.597 | -0.167 |
| -2.120999999999853 | 2.105 | -0.612 | -0.167 |
| -2.117999999999853 | 2.13 | -0.627 | -0.166 |
| -2.114999999999853 | 2.156 | -0.642 | -0.165 |
| -2.111999999999853 | 2.183 | -0.658 | -0.165 |
| -2.108999999999853 | 2.21 | -0.674 | -0.164 |
| -2.105999999999852 | 2.239 | -0.691 | -0.163 |
| -2.102999999999852 | 2.268 | -0.708 | -0.163 |
| -2.099999999999852 | 2.298 | -0.725 | -0.162 |
| -2.096999999999852 | 2.328 | -0.743 | -0.162 |
| -2.093999999999852 | 2.36 | -0.761 | -0.161 |
| -2.090999999999852 | 2.393 | -0.78 | -0.16 |
| -2.087999999999852 | 2.427 | -0.799 | -0.16 |
| -2.084999999999852 | 2.461 | -0.819 | -0.159 |
| -2.081999999999852 | 2.498 | -0.839 | -0.159 |
| -2.078999999999851 | 2.535 | -0.86 | -0.158 |
| -2.075999999999851 | 2.574 | -0.882 | -0.157 |
| -2.072999999999851 | 2.615 | -0.905 | -0.157 |
| -2.069999999999851 | 2.657 | -0.928 | -0.156 |
| -2.066999999999851 | 2.701 | -0.953 | -0.156 |
| -2.063999999999851 | 2.747 | -0.978 | -0.155 |
| -2.060999999999851 | 2.795 | -1.004 | -0.155 |
| -2.057999999999851 | 2.846 | -1.032 | -0.154 |
| -2.05499999999985 | 2.899 | -1.061 | -0.153 |
| -2.05199999999985 | 2.955 | -1.091 | -0.153 |
| -2.04899999999985 | 3.015 | -1.124 | -0.152 |
| -2.04599999999985 | 3.078 | -1.158 | -0.152 |
| -2.04299999999985 | 3.146 | -1.194 | -0.151 |
| -2.03999999999985 | 3.218 | -1.232 | -0.151 |
| -2.03699999999985 | 3.296 | -1.273 | -0.15 |
| -2.03399999999985 | 3.381 | -1.318 | -0.15 |
| -2.03099999999985 | 3.473 | -1.367 | -0.149 |
| -2.027999999999849 | 3.575 | -1.42 | -0.149 |
| -2.024999999999849 | 3.689 | -1.479 | -0.148 |
| -2.021999999999849 | 3.816 | -1.545 | -0.148 |
| -2.018999999999849 | 3.963 | -1.621 | -0.147 |
| -2.015999999999849 | 4.135 | -1.709 | -0.147 |
| -2.012999999999849 | 4.343 | -1.815 | -0.146 |
| -2.009999999999849 | 4.605 | -1.948 | -0.146 |
| -2.006999999999849 | 4.962 | -2.129 | -0.145 |
| -2.003999999999849 | 5.521 | -2.411 | -0.145 |
| -2.000999999999848 | 6.908 | -10 | -0.144 |
| -1.997999999999849 | 6.215 | -2.762 | -0.144 |
| -1.994999999999849 | 5.298 | -2.306 | -0.143 |
| -1.991999999999849 | 4.828 | -2.074 | -0.143 |
| -1.988999999999849 | 4.51 | -1.917 | -0.142 |
| -1.985999999999849 | 4.269 | -1.798 | -0.142 |
| -1.982999999999849 | 4.074 | -1.703 | -0.141 |
| -1.979999999999849 | 3.912 | -1.624 | -0.141 |
| -1.976999999999849 | 3.772 | -1.557 | -0.14 |
| -1.973999999999849 | 3.649 | -1.497 | -0.14 |
| -1.97099999999985 | 3.54 | -1.445 | -0.139 |
| -1.96799999999985 | 3.442 | -1.398 | -0.139 |
| -1.96499999999985 | 3.352 | -1.355 | -0.138 |
| -1.96199999999985 | 3.269 | -1.316 | -0.138 |
| -1.95899999999985 | 3.193 | -1.281 | -0.137 |
| -1.95599999999985 | 3.123 | -1.247 | -0.137 |
| -1.95299999999985 | 3.057 | -1.217 | -0.136 |
| -1.94999999999985 | 2.994 | -1.188 | -0.136 |
| -1.94699999999985 | 2.936 | -1.161 | -0.135 |
| -1.94399999999985 | 2.881 | -1.135 | -0.135 |
| -1.940999999999851 | 2.828 | -1.111 | -0.135 |
| -1.937999999999851 | 2.779 | -1.089 | -0.134 |
| -1.934999999999851 | 2.731 | -1.067 | -0.134 |
| -1.931999999999851 | 2.686 | -1.047 | -0.133 |
| -1.928999999999851 | 2.643 | -1.027 | -0.133 |
| -1.925999999999851 | 2.601 | -1.008 | -0.132 |
| -1.922999999999851 | 2.561 | -0.991 | -0.132 |
| -1.919999999999851 | 2.523 | -0.974 | -0.131 |
| -1.916999999999851 | 2.485 | -0.957 | -0.131 |
| -1.913999999999852 | 2.45 | -0.942 | -0.131 |
| -1.910999999999852 | 2.415 | -0.926 | -0.13 |
| -1.907999999999852 | 2.382 | -0.912 | -0.13 |
| -1.904999999999852 | 2.349 | -0.898 | -0.129 |
| -1.901999999999852 | 2.318 | -0.884 | -0.129 |
| -1.898999999999852 | 2.288 | -0.871 | -0.128 |
| -1.895999999999852 | 2.258 | -0.859 | -0.128 |
| -1.892999999999852 | 2.229 | -0.846 | -0.128 |
| -1.889999999999852 | 2.201 | -0.835 | -0.127 |
| -1.886999999999853 | 2.174 | -0.823 | -0.127 |
| -1.883999999999853 | 2.147 | -0.812 | -0.126 |
| -1.880999999999853 | 2.122 | -0.801 | -0.126 |
| -1.877999999999853 | 2.096 | -0.791 | -0.126 |
| -1.874999999999853 | 2.072 | -0.781 | -0.125 |
| -1.871999999999853 | 2.047 | -0.771 | -0.125 |
| -1.868999999999853 | 2.024 | -0.761 | -0.124 |
| -1.865999999999853 | 2.001 | -0.752 | -0.124 |
| -1.862999999999853 | 1.978 | -0.743 | -0.124 |
| -1.859999999999853 | 1.956 | -0.734 | -0.123 |
| -1.856999999999854 | 1.935 | -0.725 | -0.123 |
| -1.853999999999854 | 1.913 | -0.717 | -0.122 |
| -1.850999999999854 | 1.893 | -0.708 | -0.122 |
| -1.847999999999854 | 1.872 | -0.7 | -0.122 |
| -1.844999999999854 | 1.852 | -0.692 | -0.121 |
| -1.841999999999854 | 1.833 | -0.685 | -0.121 |
| -1.838999999999854 | 1.813 | -0.677 | -0.12 |
| -1.835999999999854 | 1.794 | -0.67 | -0.12 |
| -1.832999999999854 | 1.776 | -0.663 | -0.12 |
| -1.829999999999855 | 1.757 | -0.656 | -0.119 |
| -1.826999999999855 | 1.739 | -0.649 | -0.119 |
| -1.823999999999855 | 1.722 | -0.642 | -0.119 |
| -1.820999999999855 | 1.704 | -0.635 | -0.118 |
| -1.817999999999855 | 1.687 | -0.629 | -0.118 |
| -1.814999999999855 | 1.67 | -0.623 | -0.118 |
| -1.811999999999855 | 1.653 | -0.616 | -0.117 |
| -1.808999999999855 | 1.637 | -0.61 | -0.117 |
| -1.805999999999855 | 1.621 | -0.604 | -0.116 |
| -1.802999999999856 | 1.605 | -0.599 | -0.116 |
| -1.799999999999856 | 1.589 | -0.593 | -0.116 |
| -1.796999999999856 | 1.574 | -0.587 | -0.115 |
| -1.793999999999856 | 1.558 | -0.582 | -0.115 |
| -1.790999999999856 | 1.543 | -0.576 | -0.115 |
| -1.787999999999856 | 1.528 | -0.571 | -0.114 |
| -1.784999999999856 | 1.513 | -0.566 | -0.114 |
| -1.781999999999856 | 1.499 | -0.561 | -0.114 |
| -1.778999999999856 | 1.485 | -0.555 | -0.113 |
| -1.775999999999857 | 1.47 | -0.551 | -0.113 |
| -1.772999999999857 | 1.456 | -0.546 | -0.113 |
| -1.769999999999857 | 1.443 | -0.541 | -0.112 |
| -1.766999999999857 | 1.429 | -0.536 | -0.112 |
| -1.763999999999857 | 1.415 | -0.531 | -0.112 |
| -1.760999999999857 | 1.402 | -0.527 | -0.111 |
| -1.757999999999857 | 1.389 | -0.522 | -0.111 |
| -1.754999999999857 | 1.376 | -0.518 | -0.111 |
| -1.751999999999857 | 1.363 | -0.514 | -0.11 |
| -1.748999999999857 | 1.35 | -0.509 | -0.11 |
| -1.745999999999858 | 1.337 | -0.505 | -0.11 |
| -1.742999999999858 | 1.325 | -0.501 | -0.109 |
| -1.739999999999858 | 1.312 | -0.497 | -0.109 |
| -1.736999999999858 | 1.3 | -0.493 | -0.109 |
| -1.733999999999858 | 1.288 | -0.489 | -0.108 |
| -1.730999999999858 | 1.275 | -0.485 | -0.108 |
| -1.727999999999858 | 1.264 | -0.481 | -0.108 |
| -1.724999999999858 | 1.252 | -0.477 | -0.107 |
| -1.721999999999858 | 1.24 | -0.474 | -0.107 |
| -1.718999999999859 | 1.228 | -0.47 | -0.107 |
| -1.715999999999859 | 1.217 | -0.466 | -0.106 |
| -1.712999999999859 | 1.205 | -0.463 | -0.106 |
| -1.709999999999859 | 1.194 | -0.459 | -0.106 |
| -1.70699999999986 | 1.183 | -0.456 | -0.105 |
| -1.703999999999859 | 1.172 | -0.452 | -0.105 |
| -1.700999999999859 | 1.16 | -0.449 | -0.105 |
| -1.697999999999859 | 1.15 | -0.446 | -0.105 |
| -1.694999999999859 | 1.139 | -0.442 | -0.104 |
| -1.69199999999986 | 1.128 | -0.439 | -0.104 |
| -1.68899999999986 | 1.117 | -0.436 | -0.104 |
| -1.68599999999986 | 1.106 | -0.433 | -0.103 |
| -1.68299999999986 | 1.096 | -0.43 | -0.103 |
| -1.67999999999986 | 1.085 | -0.427 | -0.103 |
| -1.67699999999986 | 1.075 | -0.424 | -0.102 |
| -1.67399999999986 | 1.065 | -0.421 | -0.102 |
| -1.67099999999986 | 1.054 | -0.418 | -0.102 |
| -1.66799999999986 | 1.044 | -0.415 | -0.102 |
| -1.66499999999986 | 1.034 | -0.412 | -0.101 |
| -1.661999999999861 | 1.024 | -0.409 | -0.101 |
| -1.658999999999861 | 1.014 | -0.406 | -0.101 |
| -1.655999999999861 | 1.004 | -0.403 | -0.1 |
| -1.652999999999861 | 0.994 | -0.401 | -0.1 |
| -1.649999999999861 | 0.984 | -0.398 | -0.1 |
| -1.646999999999861 | 0.975 | -0.395 | -0.1 |
| -1.643999999999861 | 0.965 | -0.392 | -0.099 |
| -1.640999999999861 | 0.955 | -0.39 | -0.099 |
| -1.637999999999861 | 0.946 | -0.387 | -0.099 |
| -1.634999999999862 | 0.936 | -0.385 | -0.098 |
| -1.631999999999862 | 0.927 | -0.382 | -0.098 |
| -1.628999999999862 | 0.918 | -0.38 | -0.098 |
| -1.625999999999862 | 0.908 | -0.377 | -0.098 |
| -1.622999999999862 | 0.899 | -0.375 | -0.097 |
| -1.619999999999862 | 0.89 | -0.372 | -0.097 |
| -1.616999999999862 | 0.88 | -0.37 | -0.097 |
| -1.613999999999862 | 0.871 | -0.368 | -0.097 |
| -1.610999999999862 | 0.862 | -0.365 | -0.096 |
| -1.607999999999863 | 0.853 | -0.363 | -0.096 |
| -1.604999999999863 | 0.844 | -0.361 | -0.096 |
| -1.601999999999863 | 0.835 | -0.358 | -0.096 |
| -1.598999999999863 | 0.826 | -0.356 | -0.095 |
| -1.595999999999863 | 0.817 | -0.354 | -0.095 |
| -1.592999999999863 | 0.808 | -0.352 | -0.095 |
| -1.589999999999863 | 0.8 | -0.35 | -0.094 |
| -1.586999999999863 | 0.791 | -0.347 | -0.094 |
| -1.583999999999864 | 0.782 | -0.345 | -0.094 |
| -1.580999999999864 | 0.773 | -0.343 | -0.094 |
| -1.577999999999864 | 0.765 | -0.341 | -0.093 |
| -1.574999999999864 | 0.756 | -0.339 | -0.093 |
| -1.571999999999864 | 0.747 | -0.337 | -0.093 |
| -1.568999999999864 | 0.739 | -0.335 | -0.093 |
| -1.565999999999864 | 0.73 | -0.333 | -0.092 |
| -1.562999999999864 | 0.722 | -0.331 | -0.092 |
| -1.559999999999864 | 0.713 | -0.329 | -0.092 |
| -1.556999999999864 | 0.705 | -0.327 | -0.092 |
| -1.553999999999865 | 0.697 | -0.325 | -0.091 |
| -1.550999999999865 | 0.688 | -0.323 | -0.091 |
| -1.547999999999865 | 0.68 | -0.322 | -0.091 |
| -1.544999999999865 | 0.671 | -0.32 | -0.091 |
| -1.541999999999865 | 0.663 | -0.318 | -0.09 |
| -1.538999999999865 | 0.655 | -0.316 | -0.09 |
| -1.535999999999865 | 0.647 | -0.314 | -0.09 |
| -1.532999999999865 | 0.638 | -0.312 | -0.09 |
| -1.529999999999865 | 0.63 | -0.311 | -0.09 |
| -1.526999999999866 | 0.622 | -0.309 | -0.089 |
| -1.523999999999866 | 0.614 | -0.307 | -0.089 |
| -1.520999999999866 | 0.606 | -0.305 | -0.089 |
| -1.517999999999866 | 0.598 | -0.304 | -0.089 |
| -1.514999999999866 | 0.59 | -0.302 | -0.088 |
| -1.511999999999866 | 0.581 | -0.3 | -0.088 |
| -1.508999999999866 | 0.573 | -0.299 | -0.088 |
| -1.505999999999866 | 0.565 | -0.297 | -0.088 |
| -1.502999999999866 | 0.557 | -0.296 | -0.087 |
| -1.499999999999867 | 0.549 | -0.294 | -0.087 |
| -1.496999999999867 | 0.541 | -0.292 | -0.087 |
| -1.493999999999867 | 0.533 | -0.291 | -0.087 |
| -1.490999999999867 | 0.525 | -0.289 | -0.086 |
| -1.487999999999867 | 0.517 | -0.288 | -0.086 |
| -1.484999999999867 | 0.509 | -0.286 | -0.086 |
| -1.481999999999867 | 0.502 | -0.285 | -0.086 |
| -1.478999999999867 | 0.494 | -0.283 | -0.086 |
| -1.475999999999867 | 0.486 | -0.282 | -0.085 |
| -1.472999999999867 | 0.478 | -0.28 | -0.085 |
| -1.469999999999868 | 0.47 | -0.279 | -0.085 |
| -1.466999999999868 | 0.462 | -0.277 | -0.085 |
| -1.463999999999868 | 0.454 | -0.276 | -0.084 |
| -1.460999999999868 | 0.446 | -0.274 | -0.084 |
| -1.457999999999868 | 0.439 | -0.273 | -0.084 |
| -1.454999999999868 | 0.431 | -0.271 | -0.084 |
| -1.451999999999868 | 0.423 | -0.27 | -0.084 |
| -1.448999999999868 | 0.415 | -0.269 | -0.083 |
| -1.445999999999868 | 0.407 | -0.267 | -0.083 |
| -1.442999999999869 | 0.399 | -0.266 | -0.083 |
| -1.439999999999869 | 0.392 | -0.265 | -0.083 |
| -1.436999999999869 | 0.384 | -0.263 | -0.083 |
| -1.433999999999869 | 0.376 | -0.262 | -0.082 |
| -1.430999999999869 | 0.368 | -0.261 | -0.082 |
| -1.427999999999869 | 0.36 | -0.259 | -0.082 |
| -1.424999999999869 | 0.353 | -0.258 | -0.082 |
| -1.421999999999869 | 0.345 | -0.257 | -0.082 |
| -1.418999999999869 | 0.337 | -0.255 | -0.081 |
| -1.41599999999987 | 0.329 | -0.254 | -0.081 |
| -1.41299999999987 | 0.321 | -0.253 | -0.081 |
| -1.40999999999987 | 0.314 | -0.252 | -0.081 |
| -1.40699999999987 | 0.306 | -0.25 | -0.081 |
| -1.40399999999987 | 0.298 | -0.249 | -0.08 |
| -1.40099999999987 | 0.29 | -0.248 | -0.08 |
| -1.39799999999987 | 0.282 | -0.247 | -0.08 |
| -1.39499999999987 | 0.275 | -0.246 | -0.08 |
| -1.39199999999987 | 0.267 | -0.244 | -0.08 |
| -1.38899999999987 | 0.259 | -0.243 | -0.079 |
| -1.385999999999871 | 0.251 | -0.242 | -0.079 |
| -1.382999999999871 | 0.243 | -0.241 | -0.079 |
| -1.379999999999871 | 0.235 | -0.24 | -0.079 |
| -1.376999999999871 | 0.228 | -0.239 | -0.079 |
| -1.373999999999871 | 0.22 | -0.238 | -0.078 |
| -1.370999999999871 | 0.212 | -0.236 | -0.078 |
| -1.367999999999871 | 0.204 | -0.235 | -0.078 |
| -1.364999999999871 | 0.196 | -0.234 | -0.078 |
| -1.361999999999871 | 0.188 | -0.233 | -0.078 |
| -1.358999999999872 | 0.18 | -0.232 | -0.077 |
| -1.355999999999872 | 0.172 | -0.231 | -0.077 |
| -1.352999999999872 | 0.164 | -0.23 | -0.077 |
| -1.349999999999872 | 0.156 | -0.229 | -0.077 |
| -1.346999999999872 | 0.148 | -0.228 | -0.077 |
| -1.343999999999872 | 0.14 | -0.227 | -0.076 |
| -1.340999999999872 | 0.132 | -0.226 | -0.076 |
| -1.337999999999872 | 0.124 | -0.225 | -0.076 |
| -1.334999999999872 | 0.116 | -0.224 | -0.076 |
| -1.331999999999873 | 0.108 | -0.223 | -0.076 |
| -1.328999999999873 | 0.1 | -0.222 | -0.076 |
| -1.325999999999873 | 0.092 | -0.221 | -0.075 |
| -1.322999999999873 | 0.084 | -0.22 | -0.075 |
| -1.319999999999873 | 0.075 | -0.219 | -0.075 |
| -1.316999999999873 | 0.067 | -0.218 | -0.075 |
| -1.313999999999873 | 0.059 | -0.217 | -0.075 |
| -1.310999999999873 | 0.051 | -0.216 | -0.074 |
| -1.307999999999873 | 0.042 | -0.215 | -0.074 |
| -1.304999999999874 | 0.034 | -0.214 | -0.074 |
| -1.301999999999874 | 0.026 | -0.213 | -0.074 |
| -1.298999999999874 | 0.017 | -0.212 | -0.074 |
| -1.295999999999874 | 0.009 | -0.211 | -0.074 |
| -1.292999999999874 | 0 | -0.21 | -0.073 |
| -1.289999999999874 | -0.008 | -0.209 | -0.073 |
| -1.286999999999874 | -0.017 | -0.208 | -0.073 |
| -1.283999999999874 | -0.025 | -0.207 | -0.073 |
| -1.280999999999874 | -0.034 | -0.207 | -0.073 |
| -1.277999999999875 | -0.043 | -0.206 | -0.072 |
| -1.274999999999875 | -0.051 | -0.205 | -0.072 |
| -1.271999999999875 | -0.06 | -0.204 | -0.072 |
| -1.268999999999875 | -0.069 | -0.203 | -0.072 |
| -1.265999999999875 | -0.078 | -0.202 | -0.072 |
| -1.262999999999875 | -0.087 | -0.201 | -0.072 |
| -1.259999999999875 | -0.095 | -0.2 | -0.071 |
| -1.256999999999875 | -0.104 | -0.2 | -0.071 |
| -1.253999999999875 | -0.114 | -0.199 | -0.071 |
| -1.250999999999876 | -0.123 | -0.198 | -0.071 |
| -1.247999999999876 | -0.132 | -0.197 | -0.071 |
| -1.244999999999876 | -0.141 | -0.196 | -0.071 |
| -1.241999999999876 | -0.15 | -0.195 | -0.07 |
| -1.238999999999876 | -0.16 | -0.195 | -0.07 |
| -1.235999999999876 | -0.169 | -0.194 | -0.07 |
| -1.232999999999876 | -0.178 | -0.193 | -0.07 |
| -1.229999999999876 | -0.188 | -0.192 | -0.07 |
| -1.226999999999876 | -0.198 | -0.191 | -0.07 |
| -1.223999999999877 | -0.207 | -0.191 | -0.069 |
| -1.220999999999877 | -0.217 | -0.19 | -0.069 |
| -1.217999999999877 | -0.227 | -0.189 | -0.069 |
| -1.214999999999877 | -0.237 | -0.188 | -0.069 |
| -1.211999999999877 | -0.247 | -0.188 | -0.069 |
| -1.208999999999877 | -0.257 | -0.187 | -0.069 |
| -1.205999999999877 | -0.267 | -0.186 | -0.069 |
| -1.202999999999877 | -0.277 | -0.185 | -0.068 |
| -1.199999999999877 | -0.288 | -0.185 | -0.068 |
| -1.196999999999877 | -0.298 | -0.184 | -0.068 |
| -1.193999999999878 | -0.309 | -0.183 | -0.068 |
| -1.190999999999878 | -0.319 | -0.182 | -0.068 |
| -1.187999999999878 | -0.33 | -0.182 | -0.068 |
| -1.184999999999878 | -0.341 | -0.181 | -0.067 |
| -1.181999999999878 | -0.352 | -0.18 | -0.067 |
| -1.178999999999878 | -0.363 | -0.179 | -0.067 |
| -1.175999999999878 | -0.375 | -0.179 | -0.067 |
| -1.172999999999878 | -0.386 | -0.178 | -0.067 |
| -1.169999999999878 | -0.397 | -0.177 | -0.067 |
| -1.166999999999879 | -0.409 | -0.177 | -0.067 |
| -1.163999999999879 | -0.421 | -0.176 | -0.066 |
| -1.160999999999879 | -0.433 | -0.175 | -0.066 |
| -1.157999999999879 | -0.445 | -0.175 | -0.066 |
| -1.154999999999879 | -0.458 | -0.174 | -0.066 |
| -1.151999999999879 | -0.47 | -0.173 | -0.066 |
| -1.148999999999879 | -0.483 | -0.173 | -0.066 |
| -1.145999999999879 | -0.496 | -0.172 | -0.065 |
| -1.142999999999879 | -0.509 | -0.171 | -0.065 |
| -1.13999999999988 | -0.522 | -0.171 | -0.065 |
| -1.13699999999988 | -0.535 | -0.17 | -0.065 |
| -1.13399999999988 | -0.549 | -0.169 | -0.065 |
| -1.13099999999988 | -0.563 | -0.169 | -0.065 |
| -1.12799999999988 | -0.577 | -0.168 | -0.065 |
| -1.12499999999988 | -0.592 | -0.167 | -0.064 |
| -1.12199999999988 | -0.607 | -0.167 | -0.064 |
| -1.11899999999988 | -0.622 | -0.166 | -0.064 |
| -1.11599999999988 | -0.637 | -0.165 | -0.064 |
| -1.112999999999881 | -0.653 | -0.165 | -0.064 |
| -1.109999999999881 | -0.669 | -0.164 | -0.064 |
| -1.106999999999881 | -0.685 | -0.164 | -0.064 |
| -1.103999999999881 | -0.702 | -0.163 | -0.063 |
| -1.100999999999881 | -0.719 | -0.162 | -0.063 |
| -1.097999999999881 | -0.737 | -0.162 | -0.063 |
| -1.094999999999881 | -0.755 | -0.161 | -0.063 |
| -1.091999999999881 | -0.773 | -0.161 | -0.063 |
| -1.088999999999881 | -0.793 | -0.16 | -0.063 |
| -1.085999999999881 | -0.812 | -0.159 | -0.063 |
| -1.082999999999882 | -0.832 | -0.159 | -0.063 |
| -1.079999999999882 | -0.853 | -0.158 | -0.062 |
| -1.076999999999882 | -0.875 | -0.158 | -0.062 |
| -1.073999999999882 | -0.897 | -0.157 | -0.062 |
| -1.070999999999882 | -0.92 | -0.156 | -0.062 |
| -1.067999999999882 | -0.944 | -0.156 | -0.062 |
| -1.064999999999882 | -0.969 | -0.155 | -0.062 |
| -1.061999999999882 | -0.995 | -0.155 | -0.062 |
| -1.058999999999882 | -1.023 | -0.154 | -0.061 |
| -1.055999999999883 | -1.051 | -0.154 | -0.061 |
| -1.052999999999883 | -1.081 | -0.153 | -0.061 |
| -1.049999999999883 | -1.113 | -0.153 | -0.061 |
| -1.046999999999883 | -1.146 | -0.152 | -0.061 |
| -1.043999999999883 | -1.181 | -0.151 | -0.061 |
| -1.040999999999883 | -1.219 | -0.151 | -0.061 |
| -1.037999999999883 | -1.259 | -0.15 | -0.061 |
| -1.034999999999883 | -1.303 | -0.15 | -0.06 |
| -1.031999999999883 | -1.35 | -0.149 | -0.06 |
| -1.028999999999884 | -1.402 | -0.149 | -0.06 |
| -1.025999999999884 | -1.458 | -0.148 | -0.06 |
| -1.022999999999884 | -1.522 | -0.148 | -0.06 |
| -1.019999999999884 | -1.594 | -0.147 | -0.06 |
| -1.016999999999884 | -1.678 | -0.147 | -0.06 |
| -1.013999999999884 | -1.777 | -0.146 | -0.059 |
| -1.010999999999884 | -1.9 | -0.146 | -0.059 |
| -1.007999999999884 | -2.062 | -0.145 | -0.059 |
| -1.004999999999884 | -2.299 | -0.145 | -0.059 |
| -1.001999999999885 | -2.759 | -0.144 | -0.059 |
| -0.998999999999884 | -10 | -0.144 | -0.059 |
| -0.995999999999884 | -2.417 | -0.143 | -0.059 |
| -0.992999999999884 | -2.14 | -0.143 | -0.059 |
| -0.989999999999884 | -1.963 | -0.142 | -0.058 |
| -0.986999999999884 | -1.835 | -0.142 | -0.058 |
| -0.983999999999884 | -1.733 | -0.141 | -0.058 |
| -0.980999999999884 | -1.649 | -0.141 | -0.058 |
| -0.977999999999884 | -1.578 | -0.14 | -0.058 |
| -0.974999999999884 | -1.516 | -0.14 | -0.058 |
| -0.971999999999884 | -1.462 | -0.139 | -0.058 |
| -0.968999999999884 | -1.413 | -0.139 | -0.058 |
| -0.965999999999884 | -1.369 | -0.138 | -0.058 |
| -0.962999999999884 | -1.329 | -0.138 | -0.057 |
| -0.959999999999884 | -1.292 | -0.137 | -0.057 |
| -0.956999999999884 | -1.258 | -0.137 | -0.057 |
| -0.953999999999884 | -1.227 | -0.136 | -0.057 |
| -0.950999999999884 | -1.197 | -0.136 | -0.057 |
| -0.947999999999884 | -1.17 | -0.136 | -0.057 |
| -0.944999999999884 | -1.144 | -0.135 | -0.057 |
| -0.941999999999884 | -1.119 | -0.135 | -0.057 |
| -0.938999999999884 | -1.096 | -0.134 | -0.056 |
| -0.935999999999884 | -1.074 | -0.134 | -0.056 |
| -0.932999999999884 | -1.053 | -0.133 | -0.056 |
| -0.929999999999884 | -1.034 | -0.133 | -0.056 |
| -0.926999999999884 | -1.015 | -0.132 | -0.056 |
| -0.923999999999884 | -0.997 | -0.132 | -0.056 |
| -0.920999999999884 | -0.979 | -0.132 | -0.056 |
| -0.917999999999884 | -0.963 | -0.131 | -0.056 |
| -0.914999999999884 | -0.947 | -0.131 | -0.056 |
| -0.911999999999884 | -0.931 | -0.13 | -0.055 |
| -0.908999999999884 | -0.917 | -0.13 | -0.055 |
| -0.905999999999884 | -0.903 | -0.129 | -0.055 |
| -0.902999999999884 | -0.889 | -0.129 | -0.055 |
| -0.899999999999884 | -0.876 | -0.129 | -0.055 |
| -0.896999999999884 | -0.863 | -0.128 | -0.055 |
| -0.893999999999884 | -0.851 | -0.128 | -0.055 |
| -0.890999999999884 | -0.839 | -0.127 | -0.055 |
| -0.887999999999884 | -0.827 | -0.127 | -0.054 |
| -0.884999999999884 | -0.816 | -0.127 | -0.054 |
| -0.881999999999884 | -0.805 | -0.126 | -0.054 |
| -0.878999999999884 | -0.794 | -0.126 | -0.054 |
| -0.875999999999884 | -0.784 | -0.125 | -0.054 |
| -0.872999999999884 | -0.774 | -0.125 | -0.054 |
| -0.869999999999884 | -0.764 | -0.124 | -0.054 |
| -0.866999999999884 | -0.755 | -0.124 | -0.054 |
| -0.863999999999884 | -0.746 | -0.124 | -0.054 |
| -0.860999999999884 | -0.737 | -0.123 | -0.054 |
| -0.857999999999884 | -0.728 | -0.123 | -0.053 |
| -0.854999999999884 | -0.719 | -0.123 | -0.053 |
| -0.851999999999884 | -0.711 | -0.122 | -0.053 |
| -0.848999999999884 | -0.703 | -0.122 | -0.053 |
| -0.845999999999884 | -0.695 | -0.121 | -0.053 |
| -0.842999999999884 | -0.687 | -0.121 | -0.053 |
| -0.839999999999884 | -0.68 | -0.121 | -0.053 |
| -0.836999999999884 | -0.672 | -0.12 | -0.053 |
| -0.833999999999884 | -0.665 | -0.12 | -0.053 |
| -0.830999999999884 | -0.658 | -0.119 | -0.052 |
| -0.827999999999884 | -0.651 | -0.119 | -0.052 |
| -0.824999999999884 | -0.644 | -0.119 | -0.052 |
| -0.821999999999884 | -0.638 | -0.118 | -0.052 |
| -0.818999999999884 | -0.631 | -0.118 | -0.052 |
| -0.815999999999884 | -0.625 | -0.118 | -0.052 |
| -0.812999999999884 | -0.618 | -0.117 | -0.052 |
| -0.809999999999884 | -0.612 | -0.117 | -0.052 |
| -0.806999999999884 | -0.606 | -0.117 | -0.052 |
| -0.803999999999884 | -0.6 | -0.116 | -0.052 |
| -0.800999999999884 | -0.595 | -0.116 | -0.051 |
| -0.797999999999884 | -0.589 | -0.115 | -0.051 |
| -0.794999999999884 | -0.583 | -0.115 | -0.051 |
| -0.791999999999884 | -0.578 | -0.115 | -0.051 |
| -0.788999999999884 | -0.573 | -0.114 | -0.051 |
| -0.785999999999884 | -0.567 | -0.114 | -0.051 |
| -0.782999999999884 | -0.562 | -0.114 | -0.051 |
| -0.779999999999884 | -0.557 | -0.113 | -0.051 |
| -0.776999999999884 | -0.552 | -0.113 | -0.051 |
| -0.773999999999884 | -0.547 | -0.113 | -0.051 |
| -0.770999999999884 | -0.542 | -0.112 | -0.05 |
| -0.767999999999884 | -0.538 | -0.112 | -0.05 |
| -0.764999999999884 | -0.533 | -0.112 | -0.05 |
| -0.761999999999884 | -0.528 | -0.111 | -0.05 |
| -0.758999999999884 | -0.524 | -0.111 | -0.05 |
| -0.755999999999884 | -0.519 | -0.111 | -0.05 |
| -0.752999999999884 | -0.515 | -0.11 | -0.05 |
| -0.749999999999884 | -0.511 | -0.11 | -0.05 |
| -0.746999999999884 | -0.507 | -0.11 | -0.05 |
| -0.743999999999884 | -0.502 | -0.109 | -0.05 |
| -0.740999999999884 | -0.498 | -0.109 | -0.049 |
| -0.737999999999884 | -0.494 | -0.109 | -0.049 |
| -0.734999999999884 | -0.49 | -0.108 | -0.049 |
| -0.731999999999884 | -0.486 | -0.108 | -0.049 |
| -0.728999999999884 | -0.483 | -0.108 | -0.049 |
| -0.725999999999884 | -0.479 | -0.107 | -0.049 |
| -0.722999999999884 | -0.475 | -0.107 | -0.049 |
| -0.719999999999884 | -0.471 | -0.107 | -0.049 |
| -0.716999999999884 | -0.468 | -0.107 | -0.049 |
| -0.713999999999884 | -0.464 | -0.106 | -0.049 |
| -0.710999999999884 | -0.46 | -0.106 | -0.048 |
| -0.707999999999884 | -0.457 | -0.106 | -0.048 |
| -0.704999999999884 | -0.454 | -0.105 | -0.048 |
| -0.701999999999884 | -0.45 | -0.105 | -0.048 |
| -0.698999999999884 | -0.447 | -0.105 | -0.048 |
| -0.695999999999884 | -0.443 | -0.104 | -0.048 |
| -0.692999999999884 | -0.44 | -0.104 | -0.048 |
| -0.689999999999884 | -0.437 | -0.104 | -0.048 |
| -0.686999999999884 | -0.434 | -0.103 | -0.048 |
| -0.683999999999884 | -0.431 | -0.103 | -0.048 |
| -0.680999999999884 | -0.428 | -0.103 | -0.048 |
| -0.677999999999884 | -0.425 | -0.103 | -0.047 |
| -0.674999999999884 | -0.422 | -0.102 | -0.047 |
| -0.671999999999884 | -0.419 | -0.102 | -0.047 |
| -0.668999999999884 | -0.416 | -0.102 | -0.047 |
| -0.665999999999884 | -0.413 | -0.101 | -0.047 |
| -0.662999999999884 | -0.41 | -0.101 | -0.047 |
| -0.659999999999884 | -0.407 | -0.101 | -0.047 |
| -0.656999999999884 | -0.404 | -0.101 | -0.047 |
| -0.653999999999884 | -0.401 | -0.1 | -0.047 |
| -0.650999999999884 | -0.399 | -0.1 | -0.047 |
| -0.647999999999884 | -0.396 | -0.1 | -0.047 |
| -0.644999999999884 | -0.393 | -0.099 | -0.047 |
| -0.641999999999884 | -0.391 | -0.099 | -0.046 |
| -0.638999999999884 | -0.388 | -0.099 | -0.046 |
| -0.635999999999884 | -0.386 | -0.099 | -0.046 |
| -0.632999999999884 | -0.383 | -0.098 | -0.046 |
| -0.629999999999884 | -0.38 | -0.098 | -0.046 |
| -0.626999999999884 | -0.378 | -0.098 | -0.046 |
| -0.623999999999884 | -0.376 | -0.097 | -0.046 |
| -0.620999999999884 | -0.373 | -0.097 | -0.046 |
| -0.617999999999884 | -0.371 | -0.097 | -0.046 |
| -0.614999999999884 | -0.368 | -0.097 | -0.046 |
| -0.611999999999884 | -0.366 | -0.096 | -0.046 |
| -0.608999999999884 | -0.364 | -0.096 | -0.045 |
| -0.605999999999884 | -0.361 | -0.096 | -0.045 |
| -0.602999999999884 | -0.359 | -0.096 | -0.045 |
| -0.599999999999884 | -0.357 | -0.095 | -0.045 |
| -0.596999999999884 | -0.355 | -0.095 | -0.045 |
| -0.593999999999884 | -0.352 | -0.095 | -0.045 |
| -0.590999999999884 | -0.35 | -0.095 | -0.045 |
| -0.587999999999884 | -0.348 | -0.094 | -0.045 |
| -0.584999999999884 | -0.346 | -0.094 | -0.045 |
| -0.581999999999884 | -0.344 | -0.094 | -0.045 |
| -0.578999999999884 | -0.342 | -0.094 | -0.045 |
| -0.575999999999884 | -0.34 | -0.093 | -0.045 |
| -0.572999999999884 | -0.338 | -0.093 | -0.044 |
| -0.569999999999884 | -0.336 | -0.093 | -0.044 |
| -0.566999999999884 | -0.334 | -0.093 | -0.044 |
| -0.563999999999884 | -0.332 | -0.092 | -0.044 |
| -0.560999999999884 | -0.33 | -0.092 | -0.044 |
| -0.557999999999884 | -0.328 | -0.092 | -0.044 |
| -0.554999999999884 | -0.326 | -0.092 | -0.044 |
| -0.551999999999884 | -0.324 | -0.091 | -0.044 |
| -0.548999999999884 | -0.322 | -0.091 | -0.044 |
| -0.545999999999884 | -0.32 | -0.091 | -0.044 |
| -0.542999999999884 | -0.318 | -0.091 | -0.044 |
| -0.539999999999884 | -0.317 | -0.09 | -0.044 |
| -0.536999999999884 | -0.315 | -0.09 | -0.044 |
| -0.533999999999884 | -0.313 | -0.09 | -0.043 |
| -0.530999999999884 | -0.311 | -0.09 | -0.043 |
| -0.527999999999884 | -0.309 | -0.089 | -0.043 |
| -0.524999999999884 | -0.308 | -0.089 | -0.043 |
| -0.521999999999884 | -0.306 | -0.089 | -0.043 |
| -0.518999999999884 | -0.304 | -0.089 | -0.043 |
| -0.515999999999884 | -0.303 | -0.088 | -0.043 |
| -0.512999999999884 | -0.301 | -0.088 | -0.043 |
| -0.509999999999884 | -0.299 | -0.088 | -0.043 |
| -0.506999999999884 | -0.298 | -0.088 | -0.043 |
| -0.503999999999884 | -0.296 | -0.087 | -0.043 |
| -0.500999999999884 | -0.294 | -0.087 | -0.043 |
| -0.497999999999884 | -0.293 | -0.087 | -0.043 |
| -0.494999999999884 | -0.291 | -0.087 | -0.042 |
| -0.491999999999884 | -0.29 | -0.087 | -0.042 |
| -0.488999999999884 | -0.288 | -0.086 | -0.042 |
| -0.485999999999884 | -0.287 | -0.086 | -0.042 |
| -0.482999999999884 | -0.285 | -0.086 | -0.042 |
| -0.479999999999884 | -0.284 | -0.086 | -0.042 |
| -0.476999999999884 | -0.282 | -0.085 | -0.042 |
| -0.473999999999884 | -0.281 | -0.085 | -0.042 |
| -0.470999999999884 | -0.279 | -0.085 | -0.042 |
| -0.467999999999884 | -0.278 | -0.085 | -0.042 |
| -0.464999999999884 | -0.276 | -0.085 | -0.042 |
| -0.461999999999884 | -0.275 | -0.084 | -0.042 |
| -0.458999999999884 | -0.273 | -0.084 | -0.042 |
| -0.455999999999884 | -0.272 | -0.084 | -0.041 |
| -0.452999999999884 | -0.271 | -0.084 | -0.041 |
| -0.449999999999884 | -0.269 | -0.083 | -0.041 |
| -0.446999999999884 | -0.268 | -0.083 | -0.041 |
| -0.443999999999884 | -0.266 | -0.083 | -0.041 |
| -0.440999999999884 | -0.265 | -0.083 | -0.041 |
| -0.437999999999884 | -0.264 | -0.083 | -0.041 |
| -0.434999999999884 | -0.262 | -0.082 | -0.041 |
| -0.431999999999884 | -0.261 | -0.082 | -0.041 |
| -0.428999999999884 | -0.26 | -0.082 | -0.041 |
| -0.425999999999884 | -0.258 | -0.082 | -0.041 |
| -0.422999999999884 | -0.257 | -0.082 | -0.041 |
| -0.419999999999884 | -0.256 | -0.081 | -0.041 |
| -0.416999999999884 | -0.255 | -0.081 | -0.041 |
| -0.413999999999884 | -0.253 | -0.081 | -0.04 |
| -0.410999999999884 | -0.252 | -0.081 | -0.04 |
| -0.407999999999884 | -0.251 | -0.081 | -0.04 |
| -0.404999999999884 | -0.25 | -0.08 | -0.04 |
| -0.401999999999884 | -0.248 | -0.08 | -0.04 |
| -0.398999999999884 | -0.247 | -0.08 | -0.04 |
| -0.395999999999884 | -0.246 | -0.08 | -0.04 |
| -0.392999999999884 | -0.245 | -0.08 | -0.04 |
| -0.389999999999884 | -0.244 | -0.079 | -0.04 |
| -0.386999999999884 | -0.243 | -0.079 | -0.04 |
| -0.383999999999884 | -0.241 | -0.079 | -0.04 |
| -0.380999999999884 | -0.24 | -0.079 | -0.04 |
| -0.377999999999884 | -0.239 | -0.079 | -0.04 |
| -0.374999999999884 | -0.238 | -0.078 | -0.04 |
| -0.371999999999884 | -0.237 | -0.078 | -0.04 |
| -0.368999999999884 | -0.236 | -0.078 | -0.039 |
| -0.365999999999884 | -0.235 | -0.078 | -0.039 |
| -0.362999999999884 | -0.234 | -0.078 | -0.039 |
| -0.359999999999884 | -0.232 | -0.077 | -0.039 |
| -0.356999999999884 | -0.231 | -0.077 | -0.039 |
| -0.353999999999884 | -0.23 | -0.077 | -0.039 |
| -0.350999999999884 | -0.229 | -0.077 | -0.039 |
| -0.347999999999884 | -0.228 | -0.077 | -0.039 |
| -0.344999999999884 | -0.227 | -0.076 | -0.039 |
| -0.341999999999884 | -0.226 | -0.076 | -0.039 |
| -0.338999999999884 | -0.225 | -0.076 | -0.039 |
| -0.335999999999884 | -0.224 | -0.076 | -0.039 |
| -0.332999999999884 | -0.223 | -0.076 | -0.039 |
| -0.329999999999884 | -0.222 | -0.076 | -0.039 |
| -0.326999999999884 | -0.221 | -0.075 | -0.039 |
| -0.323999999999884 | -0.22 | -0.075 | -0.038 |
| -0.320999999999884 | -0.219 | -0.075 | -0.038 |
| -0.317999999999884 | -0.218 | -0.075 | -0.038 |
| -0.314999999999884 | -0.217 | -0.075 | -0.038 |
| -0.311999999999884 | -0.216 | -0.074 | -0.038 |
| -0.308999999999884 | -0.215 | -0.074 | -0.038 |
| -0.305999999999884 | -0.214 | -0.074 | -0.038 |
| -0.302999999999884 | -0.213 | -0.074 | -0.038 |
| -0.299999999999884 | -0.212 | -0.074 | -0.038 |
| -0.296999999999884 | -0.211 | -0.074 | -0.038 |
| -0.293999999999884 | -0.21 | -0.073 | -0.038 |
| -0.290999999999884 | -0.21 | -0.073 | -0.038 |
| -0.287999999999884 | -0.209 | -0.073 | -0.038 |
| -0.284999999999884 | -0.208 | -0.073 | -0.038 |
| -0.281999999999884 | -0.207 | -0.073 | -0.038 |
| -0.278999999999884 | -0.206 | -0.073 | -0.037 |
| -0.275999999999884 | -0.205 | -0.072 | -0.037 |
| -0.272999999999884 | -0.204 | -0.072 | -0.037 |
| -0.269999999999884 | -0.203 | -0.072 | -0.037 |
| -0.266999999999884 | -0.202 | -0.072 | -0.037 |
| -0.263999999999884 | -0.202 | -0.072 | -0.037 |
| -0.260999999999884 | -0.201 | -0.072 | -0.037 |
| -0.257999999999884 | -0.2 | -0.071 | -0.037 |
| -0.254999999999884 | -0.199 | -0.071 | -0.037 |
| -0.251999999999884 | -0.198 | -0.071 | -0.037 |
| -0.248999999999884 | -0.197 | -0.071 | -0.037 |
| -0.245999999999884 | -0.197 | -0.071 | -0.037 |
| -0.242999999999884 | -0.196 | -0.071 | -0.037 |
| -0.239999999999884 | -0.195 | -0.07 | -0.037 |
| -0.236999999999884 | -0.194 | -0.07 | -0.037 |
| -0.233999999999884 | -0.193 | -0.07 | -0.037 |
| -0.230999999999884 | -0.193 | -0.07 | -0.036 |
| -0.227999999999884 | -0.192 | -0.07 | -0.036 |
| -0.224999999999884 | -0.191 | -0.07 | -0.036 |
| -0.221999999999884 | -0.19 | -0.069 | -0.036 |
| -0.218999999999884 | -0.189 | -0.069 | -0.036 |
| -0.215999999999884 | -0.189 | -0.069 | -0.036 |
| -0.212999999999884 | -0.188 | -0.069 | -0.036 |
| -0.209999999999884 | -0.187 | -0.069 | -0.036 |
| -0.206999999999884 | -0.186 | -0.069 | -0.036 |
| -0.203999999999884 | -0.186 | -0.068 | -0.036 |
| -0.200999999999884 | -0.185 | -0.068 | -0.036 |
| -0.197999999999884 | -0.184 | -0.068 | -0.036 |
| -0.194999999999884 | -0.183 | -0.068 | -0.036 |
| -0.191999999999884 | -0.183 | -0.068 | -0.036 |
| -0.188999999999884 | -0.182 | -0.068 | -0.036 |
| -0.185999999999884 | -0.181 | -0.068 | -0.036 |
| -0.182999999999884 | -0.18 | -0.067 | -0.036 |
| -0.179999999999884 | -0.18 | -0.067 | -0.035 |
| -0.176999999999884 | -0.179 | -0.067 | -0.035 |
| -0.173999999999884 | -0.178 | -0.067 | -0.035 |
| -0.170999999999884 | -0.178 | -0.067 | -0.035 |
| -0.167999999999884 | -0.177 | -0.067 | -0.035 |
| -0.164999999999884 | -0.176 | -0.066 | -0.035 |
| -0.161999999999884 | -0.175 | -0.066 | -0.035 |
| -0.158999999999884 | -0.175 | -0.066 | -0.035 |
| -0.155999999999884 | -0.174 | -0.066 | -0.035 |
| -0.152999999999884 | -0.173 | -0.066 | -0.035 |
| -0.149999999999884 | -0.173 | -0.066 | -0.035 |
| -0.146999999999884 | -0.172 | -0.066 | -0.035 |
| -0.143999999999884 | -0.171 | -0.065 | -0.035 |
| -0.140999999999884 | -0.171 | -0.065 | -0.035 |
| -0.137999999999884 | -0.17 | -0.065 | -0.035 |
| -0.134999999999884 | -0.169 | -0.065 | -0.035 |
| -0.131999999999884 | -0.169 | -0.065 | -0.035 |
| -0.128999999999884 | -0.168 | -0.065 | -0.035 |
| -0.125999999999884 | -0.168 | -0.065 | -0.034 |
| -0.122999999999884 | -0.167 | -0.064 | -0.034 |
| -0.119999999999884 | -0.166 | -0.064 | -0.034 |
| -0.116999999999884 | -0.166 | -0.064 | -0.034 |
| -0.113999999999884 | -0.165 | -0.064 | -0.034 |
| -0.110999999999884 | -0.164 | -0.064 | -0.034 |
| -0.107999999999884 | -0.164 | -0.064 | -0.034 |
| -0.104999999999884 | -0.163 | -0.064 | -0.034 |
| -0.101999999999884 | -0.163 | -0.063 | -0.034 |
| -0.0989999999998837 | -0.162 | -0.063 | -0.034 |
| -0.0959999999998837 | -0.161 | -0.063 | -0.034 |
| -0.0929999999998837 | -0.161 | -0.063 | -0.034 |
| -0.0899999999998837 | -0.16 | -0.063 | -0.034 |
| -0.0869999999998837 | -0.16 | -0.063 | -0.034 |
| -0.0839999999998837 | -0.159 | -0.063 | -0.034 |
| -0.0809999999998837 | -0.158 | -0.062 | -0.034 |
| -0.0779999999998837 | -0.158 | -0.062 | -0.034 |
| -0.0749999999998837 | -0.157 | -0.062 | -0.034 |
| -0.0719999999998837 | -0.157 | -0.062 | -0.034 |
| -0.0689999999998837 | -0.156 | -0.062 | -0.033 |
| -0.0659999999998837 | -0.156 | -0.062 | -0.033 |
| -0.0629999999998837 | -0.155 | -0.062 | -0.033 |
| -0.0599999999998837 | -0.154 | -0.061 | -0.033 |
| -0.0569999999998837 | -0.154 | -0.061 | -0.033 |
| -0.0539999999998837 | -0.153 | -0.061 | -0.033 |
| -0.0509999999998837 | -0.153 | -0.061 | -0.033 |
| -0.0479999999998837 | -0.152 | -0.061 | -0.033 |
| -0.0449999999998837 | -0.152 | -0.061 | -0.033 |
| -0.0419999999998837 | -0.151 | -0.061 | -0.033 |
| -0.0389999999998837 | -0.151 | -0.061 | -0.033 |
| -0.0359999999998837 | -0.15 | -0.06 | -0.033 |
| -0.0329999999998837 | -0.15 | -0.06 | -0.033 |
| -0.0299999999998837 | -0.149 | -0.06 | -0.033 |
| -0.0269999999998837 | -0.148 | -0.06 | -0.033 |
| -0.0239999999998837 | -0.148 | -0.06 | -0.033 |
| -0.0209999999998837 | -0.147 | -0.06 | -0.033 |
| -0.0179999999998837 | -0.147 | -0.06 | -0.033 |
| -0.0149999999998837 | -0.146 | -0.06 | -0.033 |
| -0.0119999999998837 | -0.146 | -0.059 | -0.032 |
| -0.00899999999988368 | -0.145 | -0.059 | -0.032 |
| -0.00599999999988368 | -0.145 | -0.059 | -0.032 |
| -0.00299999999988368 | -0.144 | -0.059 | -0.032 |
| 1.16315811149459e-13 | -0.144 | -0.059 | -0.032 |